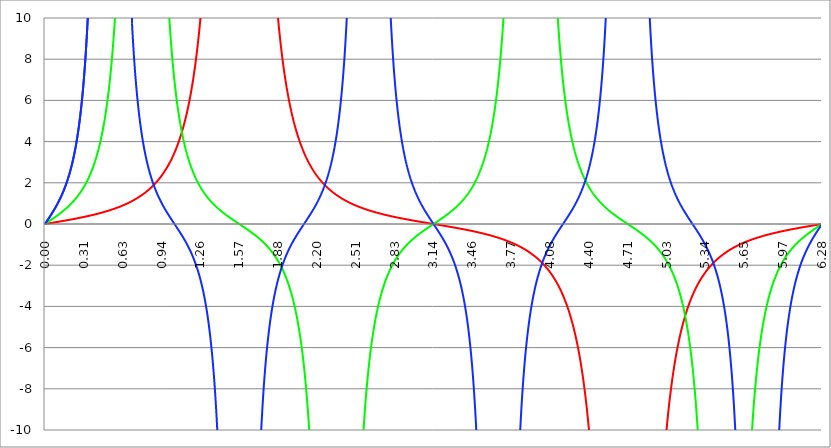
| Category | Series 1 | Series 0 | Series 2 |
|---|---|---|---|
| 0.0 | 0 | 0 | 0 |
| 0.00314159265358979 | 0.003 | 0.013 | 0.028 |
| 0.00628318530717958 | 0.006 | 0.025 | 0.057 |
| 0.00942477796076938 | 0.009 | 0.038 | 0.085 |
| 0.0125663706143592 | 0.013 | 0.05 | 0.113 |
| 0.015707963267949 | 0.016 | 0.063 | 0.142 |
| 0.0188495559215388 | 0.019 | 0.075 | 0.17 |
| 0.0219911485751285 | 0.022 | 0.088 | 0.199 |
| 0.0251327412287183 | 0.025 | 0.101 | 0.227 |
| 0.0282743338823081 | 0.028 | 0.113 | 0.256 |
| 0.0314159265358979 | 0.031 | 0.126 | 0.285 |
| 0.0345575191894877 | 0.035 | 0.139 | 0.314 |
| 0.0376991118430775 | 0.038 | 0.152 | 0.343 |
| 0.0408407044966673 | 0.041 | 0.164 | 0.372 |
| 0.0439822971502571 | 0.044 | 0.177 | 0.402 |
| 0.0471238898038469 | 0.047 | 0.19 | 0.431 |
| 0.0502654824574367 | 0.05 | 0.203 | 0.461 |
| 0.0534070751110265 | 0.054 | 0.216 | 0.491 |
| 0.0565486677646163 | 0.057 | 0.229 | 0.521 |
| 0.059690260418206 | 0.06 | 0.242 | 0.552 |
| 0.0628318530717958 | 0.063 | 0.255 | 0.583 |
| 0.0659734457253856 | 0.066 | 0.268 | 0.614 |
| 0.0691150383789754 | 0.069 | 0.281 | 0.645 |
| 0.0722566310325652 | 0.073 | 0.294 | 0.677 |
| 0.075398223686155 | 0.076 | 0.307 | 0.708 |
| 0.0785398163397448 | 0.079 | 0.321 | 0.741 |
| 0.0816814089933346 | 0.082 | 0.334 | 0.773 |
| 0.0848230016469244 | 0.085 | 0.348 | 0.806 |
| 0.0879645943005142 | 0.089 | 0.361 | 0.84 |
| 0.091106186954104 | 0.092 | 0.375 | 0.873 |
| 0.0942477796076937 | 0.095 | 0.388 | 0.908 |
| 0.0973893722612835 | 0.098 | 0.402 | 0.942 |
| 0.100530964914873 | 0.101 | 0.416 | 0.977 |
| 0.103672557568463 | 0.105 | 0.43 | 1.013 |
| 0.106814150222053 | 0.108 | 0.444 | 1.049 |
| 0.109955742875643 | 0.111 | 0.458 | 1.086 |
| 0.113097335529233 | 0.114 | 0.472 | 1.123 |
| 0.116238928182822 | 0.118 | 0.487 | 1.161 |
| 0.119380520836412 | 0.121 | 0.501 | 1.199 |
| 0.122522113490002 | 0.124 | 0.516 | 1.238 |
| 0.125663706143592 | 0.127 | 0.53 | 1.277 |
| 0.128805298797181 | 0.131 | 0.545 | 1.318 |
| 0.131946891450771 | 0.134 | 0.56 | 1.359 |
| 0.135088484104361 | 0.137 | 0.575 | 1.4 |
| 0.138230076757951 | 0.14 | 0.59 | 1.443 |
| 0.141371669411541 | 0.144 | 0.605 | 1.486 |
| 0.14451326206513 | 0.147 | 0.62 | 1.53 |
| 0.14765485471872 | 0.15 | 0.636 | 1.575 |
| 0.15079644737231 | 0.154 | 0.652 | 1.621 |
| 0.1539380400259 | 0.157 | 0.667 | 1.668 |
| 0.15707963267949 | 0.16 | 0.683 | 1.716 |
| 0.160221225333079 | 0.164 | 0.699 | 1.764 |
| 0.163362817986669 | 0.167 | 0.716 | 1.814 |
| 0.166504410640259 | 0.17 | 0.732 | 1.865 |
| 0.169646003293849 | 0.174 | 0.749 | 1.917 |
| 0.172787595947439 | 0.177 | 0.765 | 1.97 |
| 0.175929188601028 | 0.181 | 0.782 | 2.024 |
| 0.179070781254618 | 0.184 | 0.799 | 2.08 |
| 0.182212373908208 | 0.187 | 0.817 | 2.137 |
| 0.185353966561798 | 0.191 | 0.834 | 2.195 |
| 0.188495559215388 | 0.194 | 0.852 | 2.255 |
| 0.191637151868977 | 0.198 | 0.87 | 2.316 |
| 0.194778744522567 | 0.201 | 0.888 | 2.379 |
| 0.197920337176157 | 0.205 | 0.906 | 2.443 |
| 0.201061929829747 | 0.208 | 0.924 | 2.509 |
| 0.204203522483336 | 0.211 | 0.943 | 2.577 |
| 0.207345115136926 | 0.215 | 0.962 | 2.647 |
| 0.210486707790516 | 0.218 | 0.981 | 2.718 |
| 0.213628300444106 | 0.222 | 1.001 | 2.792 |
| 0.216769893097696 | 0.226 | 1.02 | 2.867 |
| 0.219911485751285 | 0.229 | 1.04 | 2.945 |
| 0.223053078404875 | 0.233 | 1.06 | 3.025 |
| 0.226194671058465 | 0.236 | 1.081 | 3.107 |
| 0.229336263712055 | 0.24 | 1.101 | 3.192 |
| 0.232477856365645 | 0.243 | 1.122 | 3.28 |
| 0.235619449019234 | 0.247 | 1.144 | 3.37 |
| 0.238761041672824 | 0.251 | 1.165 | 3.462 |
| 0.241902634326414 | 0.254 | 1.187 | 3.558 |
| 0.245044226980004 | 0.258 | 1.209 | 3.657 |
| 0.248185819633594 | 0.261 | 1.232 | 3.759 |
| 0.251327412287183 | 0.265 | 1.255 | 3.865 |
| 0.254469004940773 | 0.269 | 1.278 | 3.974 |
| 0.257610597594363 | 0.272 | 1.301 | 4.086 |
| 0.260752190247953 | 0.276 | 1.325 | 4.203 |
| 0.263893782901543 | 0.28 | 1.35 | 4.324 |
| 0.267035375555132 | 0.284 | 1.374 | 4.448 |
| 0.270176968208722 | 0.287 | 1.399 | 4.578 |
| 0.273318560862312 | 0.291 | 1.425 | 4.712 |
| 0.276460153515902 | 0.295 | 1.45 | 4.851 |
| 0.279601746169492 | 0.299 | 1.477 | 4.996 |
| 0.282743338823082 | 0.303 | 1.503 | 5.146 |
| 0.285884931476671 | 0.306 | 1.53 | 5.301 |
| 0.289026524130261 | 0.31 | 1.558 | 5.463 |
| 0.292168116783851 | 0.314 | 1.586 | 5.632 |
| 0.295309709437441 | 0.318 | 1.614 | 5.807 |
| 0.298451302091031 | 0.322 | 1.643 | 5.989 |
| 0.30159289474462 | 0.326 | 1.673 | 6.179 |
| 0.30473448739821 | 0.33 | 1.703 | 6.377 |
| 0.3078760800518 | 0.334 | 1.733 | 6.584 |
| 0.31101767270539 | 0.338 | 1.764 | 6.8 |
| 0.31415926535898 | 0.342 | 1.796 | 7.025 |
| 0.31730085801257 | 0.346 | 1.828 | 7.26 |
| 0.320442450666159 | 0.35 | 1.861 | 7.507 |
| 0.323584043319749 | 0.354 | 1.895 | 7.765 |
| 0.326725635973339 | 0.358 | 1.929 | 8.035 |
| 0.329867228626929 | 0.362 | 1.963 | 8.319 |
| 0.333008821280519 | 0.366 | 1.999 | 8.616 |
| 0.336150413934108 | 0.37 | 2.035 | 8.928 |
| 0.339292006587698 | 0.374 | 2.072 | 9.256 |
| 0.342433599241288 | 0.378 | 2.109 | 9.602 |
| 0.345575191894878 | 0.383 | 2.147 | 9.965 |
| 0.348716784548468 | 0.387 | 2.186 | 10.348 |
| 0.351858377202058 | 0.391 | 2.226 | 10.753 |
| 0.354999969855647 | 0.395 | 2.267 | 11.18 |
| 0.358141562509237 | 0.4 | 2.308 | 11.631 |
| 0.361283155162827 | 0.404 | 2.351 | 12.109 |
| 0.364424747816417 | 0.408 | 2.394 | 12.615 |
| 0.367566340470007 | 0.413 | 2.438 | 13.152 |
| 0.370707933123597 | 0.417 | 2.483 | 13.722 |
| 0.373849525777186 | 0.421 | 2.529 | 14.328 |
| 0.376991118430776 | 0.426 | 2.576 | 14.973 |
| 0.380132711084366 | 0.43 | 2.625 | 15.661 |
| 0.383274303737956 | 0.435 | 2.674 | 16.396 |
| 0.386415896391546 | 0.439 | 2.724 | 17.182 |
| 0.389557489045135 | 0.444 | 2.776 | 18.023 |
| 0.392699081698725 | 0.448 | 2.828 | 18.926 |
| 0.395840674352315 | 0.453 | 2.882 | 19.896 |
| 0.398982267005905 | 0.458 | 2.938 | 20.94 |
| 0.402123859659495 | 0.462 | 2.994 | 22.066 |
| 0.405265452313085 | 0.467 | 3.052 | 23.282 |
| 0.408407044966674 | 0.472 | 3.111 | 24.6 |
| 0.411548637620264 | 0.476 | 3.172 | 26.029 |
| 0.414690230273854 | 0.481 | 3.234 | 27.584 |
| 0.417831822927444 | 0.486 | 3.298 | 29.279 |
| 0.420973415581034 | 0.491 | 3.363 | 31.133 |
| 0.424115008234623 | 0.495 | 3.43 | 33.164 |
| 0.427256600888213 | 0.5 | 3.499 | 35.398 |
| 0.430398193541803 | 0.505 | 3.57 | 37.861 |
| 0.433539786195393 | 0.51 | 3.642 | 40.585 |
| 0.436681378848983 | 0.515 | 3.716 | 43.611 |
| 0.439822971502573 | 0.52 | 3.793 | 46.983 |
| 0.442964564156162 | 0.525 | 3.871 | 50.757 |
| 0.446106156809752 | 0.53 | 3.952 | 54.999 |
| 0.449247749463342 | 0.535 | 4.034 | 59.789 |
| 0.452389342116932 | 0.54 | 4.119 | 65.228 |
| 0.455530934770522 | 0.546 | 4.207 | 71.437 |
| 0.458672527424111 | 0.551 | 4.297 | 78.568 |
| 0.461814120077701 | 0.556 | 4.389 | 86.815 |
| 0.464955712731291 | 0.561 | 4.484 | 96.422 |
| 0.468097305384881 | 0.567 | 4.582 | 107.706 |
| 0.471238898038471 | 0.572 | 4.683 | 121.081 |
| 0.474380490692061 | 0.577 | 4.787 | 137.099 |
| 0.47752208334565 | 0.583 | 4.894 | 156.503 |
| 0.48066367599924 | 0.588 | 5.005 | 180.32 |
| 0.48380526865283 | 0.594 | 5.118 | 209.999 |
| 0.48694686130642 | 0.599 | 5.236 | 247.631 |
| 0.49008845396001 | 0.605 | 5.357 | 296.338 |
| 0.493230046613599 | 0.61 | 5.482 | 360.93 |
| 0.496371639267189 | 0.616 | 5.611 | 449.149 |
| 0.499513231920779 | 0.622 | 5.744 | 574.099 |
| 0.502654824574369 | 0.627 | 5.882 | 759.408 |
| 0.505796417227959 | 0.633 | 6.024 | 1051.276 |
| 0.508938009881549 | 0.639 | 6.171 | 1550.334 |
| 0.512079602535138 | 0.645 | 6.323 | 2511.595 |
| 0.515221195188728 | 0.651 | 6.481 | 4748.93 |
| 0.518362787842318 | 0.657 | 6.643 | 12158.042 |
| 0.521504380495908 | 0.663 | 6.812 | 75990.388 |
| 0.524645973149498 | 0.669 | 6.987 | 303963.051 |
| 0.527787565803087 | 0.675 | 7.168 | 18997.222 |
| 0.530929158456677 | 0.681 | 7.356 | 6202.838 |
| 0.534070751110267 | 0.687 | 7.552 | 3039.135 |
| 0.537212343763857 | 0.693 | 7.754 | 1798.101 |
| 0.540353936417447 | 0.7 | 7.964 | 1186.857 |
| 0.543495529071037 | 0.706 | 8.183 | 841.504 |
| 0.546637121724626 | 0.712 | 8.41 | 627.523 |
| 0.549778714378216 | 0.719 | 8.646 | 485.841 |
| 0.552920307031806 | 0.725 | 8.892 | 387.207 |
| 0.556061899685396 | 0.732 | 9.148 | 315.798 |
| 0.559203492338986 | 0.738 | 9.414 | 262.442 |
| 0.562345084992576 | 0.745 | 9.692 | 221.531 |
| 0.565486677646165 | 0.752 | 9.982 | 189.474 |
| 0.568628270299755 | 0.758 | 10.285 | 163.89 |
| 0.571769862953345 | 0.765 | 10.601 | 143.146 |
| 0.574911455606935 | 0.772 | 10.931 | 126.095 |
| 0.578053048260525 | 0.779 | 11.276 | 111.908 |
| 0.581194640914114 | 0.786 | 11.637 | 99.979 |
| 0.584336233567704 | 0.793 | 12.016 | 89.852 |
| 0.587477826221294 | 0.8 | 12.412 | 81.182 |
| 0.590619418874884 | 0.807 | 12.828 | 73.703 |
| 0.593761011528474 | 0.814 | 13.264 | 67.205 |
| 0.596902604182064 | 0.822 | 13.722 | 61.525 |
| 0.600044196835653 | 0.829 | 14.204 | 56.53 |
| 0.603185789489243 | 0.836 | 14.71 | 52.115 |
| 0.606327382142833 | 0.844 | 15.244 | 48.193 |
| 0.609468974796423 | 0.851 | 15.806 | 44.694 |
| 0.612610567450013 | 0.859 | 16.4 | 41.558 |
| 0.615752160103602 | 0.867 | 17.026 | 38.738 |
| 0.618893752757192 | 0.874 | 17.689 | 36.192 |
| 0.622035345410782 | 0.882 | 18.389 | 33.885 |
| 0.625176938064372 | 0.89 | 19.132 | 31.789 |
| 0.628318530717962 | 0.898 | 19.919 | 29.879 |
| 0.631460123371551 | 0.906 | 20.755 | 28.133 |
| 0.634601716025141 | 0.914 | 21.644 | 26.533 |
| 0.637743308678731 | 0.922 | 22.59 | 25.063 |
| 0.640884901332321 | 0.931 | 23.598 | 23.71 |
| 0.644026493985911 | 0.939 | 24.675 | 22.461 |
| 0.647168086639501 | 0.947 | 25.825 | 21.306 |
| 0.65030967929309 | 0.956 | 27.057 | 20.235 |
| 0.65345127194668 | 0.964 | 28.378 | 19.241 |
| 0.65659286460027 | 0.973 | 29.796 | 18.317 |
| 0.65973445725386 | 0.982 | 31.322 | 17.456 |
| 0.66287604990745 | 0.99 | 32.967 | 16.652 |
| 0.666017642561039 | 0.999 | 34.743 | 15.901 |
| 0.669159235214629 | 1.008 | 36.666 | 15.198 |
| 0.672300827868219 | 1.017 | 38.751 | 14.538 |
| 0.675442420521809 | 1.027 | 41.017 | 13.92 |
| 0.678584013175399 | 1.036 | 43.485 | 13.338 |
| 0.681725605828989 | 1.045 | 46.182 | 12.79 |
| 0.684867198482578 | 1.055 | 49.135 | 12.274 |
| 0.688008791136168 | 1.064 | 52.379 | 11.787 |
| 0.691150383789758 | 1.074 | 55.952 | 11.327 |
| 0.694291976443348 | 1.083 | 59.901 | 10.892 |
| 0.697433569096938 | 1.093 | 64.281 | 10.481 |
| 0.700575161750528 | 1.103 | 69.157 | 10.091 |
| 0.703716754404117 | 1.113 | 74.605 | 9.721 |
| 0.706858347057707 | 1.123 | 80.721 | 9.37 |
| 0.709999939711297 | 1.133 | 87.616 | 9.036 |
| 0.713141532364887 | 1.144 | 95.431 | 8.718 |
| 0.716283125018477 | 1.154 | 104.335 | 8.416 |
| 0.719424717672066 | 1.165 | 114.541 | 8.128 |
| 0.722566310325656 | 1.175 | 126.316 | 7.854 |
| 0.725707902979246 | 1.186 | 139.999 | 7.592 |
| 0.728849495632836 | 1.197 | 156.025 | 7.341 |
| 0.731991088286426 | 1.208 | 174.961 | 7.102 |
| 0.735132680940016 | 1.219 | 197.558 | 6.874 |
| 0.738274273593605 | 1.23 | 224.824 | 6.655 |
| 0.741415866247195 | 1.242 | 258.138 | 6.445 |
| 0.744557458900785 | 1.253 | 299.433 | 6.244 |
| 0.747699051554375 | 1.265 | 351.476 | 6.052 |
| 0.750840644207965 | 1.276 | 418.349 | 5.867 |
| 0.753982236861554 | 1.288 | 506.272 | 5.689 |
| 0.757123829515144 | 1.3 | 625.106 | 5.519 |
| 0.760265422168734 | 1.312 | 791.238 | 5.355 |
| 0.763407014822324 | 1.325 | 1033.556 | 5.197 |
| 0.766548607475914 | 1.337 | 1406.905 | 5.045 |
| 0.769690200129504 | 1.349 | 2026.09 | 4.899 |
| 0.772831792783093 | 1.362 | 3165.954 | 4.758 |
| 0.775973385436683 | 1.375 | 5628.621 | 4.622 |
| 0.779114978090273 | 1.388 | 12664.815 | 4.491 |
| 0.782256570743863 | 1.401 | 50660.258 | 4.365 |
| 0.785398163397453 | 1.414 | 25706381619688702014243471360 | 4.243 |
| 0.788539756051042 | 1.428 | 50660.258 | 4.125 |
| 0.791681348704632 | 1.441 | 12664.815 | 4.011 |
| 0.794822941358222 | 1.455 | 5628.621 | 3.901 |
| 0.797964534011812 | 1.469 | 3165.954 | 3.794 |
| 0.801106126665402 | 1.483 | 2026.09 | 3.691 |
| 0.804247719318992 | 1.497 | 1406.905 | 3.591 |
| 0.807389311972581 | 1.511 | 1033.556 | 3.494 |
| 0.810530904626171 | 1.526 | 791.238 | 3.4 |
| 0.813672497279761 | 1.541 | 625.106 | 3.309 |
| 0.816814089933351 | 1.556 | 506.272 | 3.221 |
| 0.819955682586941 | 1.571 | 418.349 | 3.135 |
| 0.823097275240531 | 1.586 | 351.476 | 3.052 |
| 0.82623886789412 | 1.601 | 299.433 | 2.971 |
| 0.82938046054771 | 1.617 | 258.138 | 2.893 |
| 0.8325220532013 | 1.633 | 224.824 | 2.817 |
| 0.83566364585489 | 1.649 | 197.558 | 2.743 |
| 0.83880523850848 | 1.665 | 174.961 | 2.67 |
| 0.841946831162069 | 1.682 | 156.025 | 2.6 |
| 0.845088423815659 | 1.698 | 139.999 | 2.532 |
| 0.848230016469249 | 1.715 | 126.316 | 2.465 |
| 0.851371609122839 | 1.732 | 114.541 | 2.4 |
| 0.854513201776429 | 1.75 | 104.335 | 2.337 |
| 0.857654794430019 | 1.767 | 95.431 | 2.275 |
| 0.860796387083608 | 1.785 | 87.616 | 2.215 |
| 0.863937979737198 | 1.803 | 80.721 | 2.156 |
| 0.867079572390788 | 1.821 | 74.605 | 2.099 |
| 0.870221165044378 | 1.84 | 69.157 | 2.043 |
| 0.873362757697968 | 1.858 | 64.281 | 1.988 |
| 0.876504350351557 | 1.877 | 59.901 | 1.934 |
| 0.879645943005147 | 1.896 | 55.952 | 1.882 |
| 0.882787535658737 | 1.916 | 52.379 | 1.831 |
| 0.885929128312327 | 1.936 | 49.135 | 1.781 |
| 0.889070720965917 | 1.956 | 46.182 | 1.732 |
| 0.892212313619507 | 1.976 | 43.485 | 1.684 |
| 0.895353906273096 | 1.996 | 41.017 | 1.637 |
| 0.898495498926686 | 2.017 | 38.751 | 1.59 |
| 0.901637091580276 | 2.038 | 36.666 | 1.545 |
| 0.904778684233866 | 2.06 | 34.743 | 1.501 |
| 0.907920276887456 | 2.081 | 32.967 | 1.457 |
| 0.911061869541045 | 2.103 | 31.322 | 1.415 |
| 0.914203462194635 | 2.126 | 29.796 | 1.373 |
| 0.917345054848225 | 2.148 | 28.378 | 1.331 |
| 0.920486647501815 | 2.171 | 27.057 | 1.291 |
| 0.923628240155405 | 2.195 | 25.825 | 1.251 |
| 0.926769832808995 | 2.218 | 24.675 | 1.212 |
| 0.929911425462584 | 2.242 | 23.598 | 1.173 |
| 0.933053018116174 | 2.267 | 22.59 | 1.135 |
| 0.936194610769764 | 2.291 | 21.644 | 1.098 |
| 0.939336203423354 | 2.316 | 20.755 | 1.061 |
| 0.942477796076944 | 2.342 | 19.919 | 1.025 |
| 0.945619388730533 | 2.367 | 19.132 | 0.989 |
| 0.948760981384123 | 2.394 | 18.389 | 0.954 |
| 0.951902574037713 | 2.42 | 17.689 | 0.919 |
| 0.955044166691303 | 2.447 | 17.026 | 0.885 |
| 0.958185759344893 | 2.475 | 16.4 | 0.851 |
| 0.961327351998483 | 2.502 | 15.806 | 0.817 |
| 0.964468944652072 | 2.531 | 15.244 | 0.784 |
| 0.967610537305662 | 2.559 | 14.71 | 0.752 |
| 0.970752129959252 | 2.588 | 14.204 | 0.719 |
| 0.973893722612842 | 2.618 | 13.722 | 0.687 |
| 0.977035315266432 | 2.648 | 13.264 | 0.655 |
| 0.980176907920022 | 2.678 | 12.828 | 0.624 |
| 0.983318500573611 | 2.709 | 12.412 | 0.593 |
| 0.986460093227201 | 2.741 | 12.016 | 0.562 |
| 0.989601685880791 | 2.773 | 11.637 | 0.531 |
| 0.992743278534381 | 2.805 | 11.276 | 0.501 |
| 0.995884871187971 | 2.838 | 10.931 | 0.471 |
| 0.99902646384156 | 2.872 | 10.601 | 0.441 |
| 1.00216805649515 | 2.906 | 10.285 | 0.411 |
| 1.00530964914874 | 2.941 | 9.982 | 0.382 |
| 1.00845124180233 | 2.976 | 9.692 | 0.353 |
| 1.01159283445592 | 3.012 | 9.414 | 0.324 |
| 1.01473442710951 | 3.048 | 9.148 | 0.294 |
| 1.017876019763099 | 3.085 | 8.892 | 0.266 |
| 1.021017612416689 | 3.123 | 8.646 | 0.237 |
| 1.02415920507028 | 3.162 | 8.41 | 0.208 |
| 1.027300797723869 | 3.201 | 8.183 | 0.18 |
| 1.030442390377459 | 3.24 | 7.964 | 0.151 |
| 1.033583983031048 | 3.281 | 7.754 | 0.123 |
| 1.036725575684638 | 3.322 | 7.552 | 0.094 |
| 1.039867168338228 | 3.364 | 7.356 | 0.066 |
| 1.043008760991818 | 3.406 | 7.168 | 0.038 |
| 1.046150353645408 | 3.449 | 6.987 | 0.009 |
| 1.049291946298998 | 3.494 | 6.812 | -0.019 |
| 1.052433538952587 | 3.539 | 6.643 | -0.047 |
| 1.055575131606177 | 3.584 | 6.481 | -0.075 |
| 1.058716724259767 | 3.631 | 6.323 | -0.104 |
| 1.061858316913357 | 3.678 | 6.171 | -0.132 |
| 1.064999909566947 | 3.727 | 6.024 | -0.161 |
| 1.068141502220536 | 3.776 | 5.882 | -0.189 |
| 1.071283094874126 | 3.826 | 5.744 | -0.218 |
| 1.074424687527716 | 3.877 | 5.611 | -0.246 |
| 1.077566280181306 | 3.929 | 5.482 | -0.275 |
| 1.080707872834896 | 3.982 | 5.357 | -0.304 |
| 1.083849465488486 | 4.036 | 5.236 | -0.333 |
| 1.086991058142075 | 4.091 | 5.118 | -0.362 |
| 1.090132650795665 | 4.148 | 5.005 | -0.392 |
| 1.093274243449255 | 4.205 | 4.894 | -0.421 |
| 1.096415836102845 | 4.263 | 4.787 | -0.451 |
| 1.099557428756435 | 4.323 | 4.683 | -0.481 |
| 1.102699021410025 | 4.384 | 4.582 | -0.511 |
| 1.105840614063614 | 4.446 | 4.484 | -0.542 |
| 1.108982206717204 | 4.509 | 4.389 | -0.572 |
| 1.112123799370794 | 4.574 | 4.297 | -0.603 |
| 1.115265392024384 | 4.64 | 4.207 | -0.634 |
| 1.118406984677974 | 4.707 | 4.119 | -0.666 |
| 1.121548577331563 | 4.776 | 4.034 | -0.698 |
| 1.124690169985153 | 4.846 | 3.952 | -0.73 |
| 1.127831762638743 | 4.918 | 3.871 | -0.762 |
| 1.130973355292333 | 4.991 | 3.793 | -0.795 |
| 1.134114947945923 | 5.066 | 3.716 | -0.828 |
| 1.137256540599513 | 5.142 | 3.642 | -0.862 |
| 1.140398133253102 | 5.22 | 3.57 | -0.896 |
| 1.143539725906692 | 5.3 | 3.499 | -0.931 |
| 1.146681318560282 | 5.382 | 3.43 | -0.966 |
| 1.149822911213872 | 5.465 | 3.363 | -1.001 |
| 1.152964503867462 | 5.551 | 3.298 | -1.037 |
| 1.156106096521051 | 5.638 | 3.234 | -1.073 |
| 1.159247689174641 | 5.727 | 3.172 | -1.11 |
| 1.162389281828231 | 5.819 | 3.111 | -1.148 |
| 1.165530874481821 | 5.912 | 3.052 | -1.186 |
| 1.168672467135411 | 6.008 | 2.994 | -1.225 |
| 1.171814059789001 | 6.106 | 2.938 | -1.264 |
| 1.17495565244259 | 6.206 | 2.882 | -1.304 |
| 1.17809724509618 | 6.309 | 2.828 | -1.345 |
| 1.18123883774977 | 6.414 | 2.776 | -1.386 |
| 1.18438043040336 | 6.522 | 2.724 | -1.429 |
| 1.18752202305695 | 6.632 | 2.674 | -1.472 |
| 1.190663615710539 | 6.745 | 2.625 | -1.516 |
| 1.193805208364129 | 6.861 | 2.576 | -1.56 |
| 1.19694680101772 | 6.98 | 2.529 | -1.606 |
| 1.200088393671309 | 7.102 | 2.483 | -1.652 |
| 1.203229986324899 | 7.227 | 2.438 | -1.7 |
| 1.206371578978489 | 7.355 | 2.394 | -1.748 |
| 1.209513171632078 | 7.487 | 2.351 | -1.797 |
| 1.212654764285668 | 7.622 | 2.308 | -1.848 |
| 1.215796356939258 | 7.761 | 2.267 | -1.899 |
| 1.218937949592848 | 7.903 | 2.226 | -1.952 |
| 1.222079542246438 | 8.05 | 2.186 | -2.006 |
| 1.225221134900027 | 8.2 | 2.147 | -2.061 |
| 1.228362727553617 | 8.354 | 2.109 | -2.118 |
| 1.231504320207207 | 8.513 | 2.072 | -2.176 |
| 1.234645912860797 | 8.676 | 2.035 | -2.235 |
| 1.237787505514387 | 8.844 | 1.999 | -2.296 |
| 1.240929098167977 | 9.017 | 1.963 | -2.358 |
| 1.244070690821566 | 9.195 | 1.929 | -2.422 |
| 1.247212283475156 | 9.378 | 1.895 | -2.487 |
| 1.250353876128746 | 9.566 | 1.861 | -2.554 |
| 1.253495468782336 | 9.76 | 1.828 | -2.623 |
| 1.256637061435926 | 9.96 | 1.796 | -2.694 |
| 1.259778654089515 | 10.165 | 1.764 | -2.767 |
| 1.262920246743105 | 10.378 | 1.733 | -2.842 |
| 1.266061839396695 | 10.596 | 1.703 | -2.919 |
| 1.269203432050285 | 10.822 | 1.673 | -2.998 |
| 1.272345024703875 | 11.055 | 1.643 | -3.08 |
| 1.275486617357465 | 11.295 | 1.614 | -3.164 |
| 1.278628210011054 | 11.543 | 1.586 | -3.25 |
| 1.281769802664644 | 11.799 | 1.558 | -3.339 |
| 1.284911395318234 | 12.064 | 1.53 | -3.431 |
| 1.288052987971824 | 12.337 | 1.503 | -3.526 |
| 1.291194580625414 | 12.62 | 1.477 | -3.624 |
| 1.294336173279003 | 12.913 | 1.45 | -3.725 |
| 1.297477765932593 | 13.215 | 1.425 | -3.829 |
| 1.300619358586183 | 13.528 | 1.399 | -3.937 |
| 1.303760951239773 | 13.853 | 1.374 | -4.048 |
| 1.306902543893363 | 14.189 | 1.35 | -4.164 |
| 1.310044136546953 | 14.537 | 1.325 | -4.283 |
| 1.313185729200542 | 14.898 | 1.301 | -4.406 |
| 1.316327321854132 | 15.272 | 1.278 | -4.534 |
| 1.319468914507722 | 15.661 | 1.255 | -4.667 |
| 1.322610507161312 | 16.064 | 1.232 | -4.804 |
| 1.325752099814902 | 16.484 | 1.209 | -4.947 |
| 1.328893692468491 | 16.919 | 1.187 | -5.095 |
| 1.332035285122081 | 17.372 | 1.165 | -5.249 |
| 1.335176877775671 | 17.843 | 1.144 | -5.409 |
| 1.338318470429261 | 18.333 | 1.122 | -5.575 |
| 1.341460063082851 | 18.843 | 1.101 | -5.747 |
| 1.344601655736441 | 19.375 | 1.081 | -5.927 |
| 1.34774324839003 | 19.93 | 1.06 | -6.115 |
| 1.35088484104362 | 20.508 | 1.04 | -6.31 |
| 1.35402643369721 | 21.112 | 1.02 | -6.514 |
| 1.3571680263508 | 21.743 | 1.001 | -6.727 |
| 1.36030961900439 | 22.402 | 0.981 | -6.949 |
| 1.363451211657979 | 23.091 | 0.962 | -7.181 |
| 1.36659280431157 | 23.812 | 0.943 | -7.424 |
| 1.369734396965159 | 24.568 | 0.924 | -7.678 |
| 1.372875989618749 | 25.359 | 0.906 | -7.944 |
| 1.376017582272339 | 26.189 | 0.888 | -8.223 |
| 1.379159174925929 | 27.061 | 0.87 | -8.515 |
| 1.382300767579518 | 27.976 | 0.852 | -8.822 |
| 1.385442360233108 | 28.938 | 0.834 | -9.145 |
| 1.388583952886698 | 29.951 | 0.817 | -9.485 |
| 1.391725545540288 | 31.017 | 0.799 | -9.842 |
| 1.394867138193878 | 32.141 | 0.782 | -10.218 |
| 1.398008730847468 | 33.326 | 0.765 | -10.616 |
| 1.401150323501057 | 34.578 | 0.749 | -11.035 |
| 1.404291916154647 | 35.902 | 0.732 | -11.478 |
| 1.407433508808237 | 37.303 | 0.716 | -11.946 |
| 1.410575101461827 | 38.787 | 0.699 | -12.443 |
| 1.413716694115417 | 40.36 | 0.683 | -12.969 |
| 1.416858286769006 | 42.032 | 0.667 | -13.528 |
| 1.419999879422596 | 43.808 | 0.652 | -14.122 |
| 1.423141472076186 | 45.7 | 0.636 | -14.754 |
| 1.426283064729776 | 47.715 | 0.62 | -15.427 |
| 1.429424657383366 | 49.867 | 0.605 | -16.146 |
| 1.432566250036956 | 52.168 | 0.59 | -16.914 |
| 1.435707842690545 | 54.63 | 0.575 | -17.736 |
| 1.438849435344135 | 57.271 | 0.56 | -18.618 |
| 1.441991027997725 | 60.107 | 0.545 | -19.565 |
| 1.445132620651315 | 63.158 | 0.53 | -20.583 |
| 1.448274213304905 | 66.447 | 0.516 | -21.681 |
| 1.451415805958494 | 70 | 0.501 | -22.866 |
| 1.454557398612084 | 73.844 | 0.487 | -24.149 |
| 1.457698991265674 | 78.013 | 0.472 | -25.539 |
| 1.460840583919264 | 82.544 | 0.458 | -27.051 |
| 1.463982176572854 | 87.481 | 0.444 | -28.698 |
| 1.467123769226444 | 92.873 | 0.43 | -30.496 |
| 1.470265361880033 | 98.779 | 0.416 | -32.466 |
| 1.473406954533623 | 105.266 | 0.402 | -34.629 |
| 1.476548547187213 | 112.412 | 0.388 | -37.012 |
| 1.479690139840803 | 120.31 | 0.375 | -39.646 |
| 1.482831732494393 | 129.069 | 0.361 | -42.566 |
| 1.485973325147982 | 138.819 | 0.348 | -45.817 |
| 1.489114917801572 | 149.716 | 0.334 | -49.451 |
| 1.492256510455162 | 161.947 | 0.321 | -53.528 |
| 1.495398103108752 | 175.738 | 0.307 | -58.126 |
| 1.498539695762342 | 191.366 | 0.294 | -63.336 |
| 1.501681288415932 | 209.174 | 0.281 | -69.273 |
| 1.504822881069521 | 229.586 | 0.268 | -76.078 |
| 1.507964473723111 | 253.136 | 0.255 | -83.928 |
| 1.511106066376701 | 280.501 | 0.242 | -93.05 |
| 1.514247659030291 | 312.553 | 0.229 | -103.735 |
| 1.517389251683881 | 350.425 | 0.216 | -116.36 |
| 1.520530844337471 | 395.619 | 0.203 | -131.425 |
| 1.52367243699106 | 450.15 | 0.19 | -149.602 |
| 1.52681402964465 | 516.778 | 0.177 | -171.812 |
| 1.52995562229824 | 599.367 | 0.164 | -199.342 |
| 1.53309721495183 | 703.453 | 0.152 | -234.038 |
| 1.53623880760542 | 837.198 | 0.139 | -278.62 |
| 1.539380400259009 | 1013.045 | 0.126 | -337.236 |
| 1.542521992912599 | 1250.712 | 0.113 | -416.458 |
| 1.545663585566189 | 1582.977 | 0.101 | -527.214 |
| 1.548805178219779 | 2067.613 | 0.088 | -688.759 |
| 1.551946770873369 | 2814.311 | 0.075 | -937.659 |
| 1.555088363526959 | 4052.681 | 0.063 | -1350.449 |
| 1.558229956180548 | 6332.407 | 0.05 | -2110.358 |
| 1.561371548834138 | 11257.743 | 0.038 | -3752.136 |
| 1.564513141487728 | 25330.129 | 0.025 | -8442.932 |
| 1.567654734141318 | 101321.017 | 0.013 | -33773.228 |
| 1.570796326794908 | 8203238119201189953198358528 | 0 | -2662539128422490196662026240 |
| 1.573937919448497 | 101321.017 | -0.013 | -33773.228 |
| 1.577079512102087 | 25330.129 | -0.025 | -8442.932 |
| 1.580221104755677 | 11257.743 | -0.038 | -3752.136 |
| 1.583362697409267 | 6332.407 | -0.05 | -2110.358 |
| 1.586504290062857 | 4052.681 | -0.063 | -1350.449 |
| 1.589645882716447 | 2814.311 | -0.075 | -937.659 |
| 1.592787475370036 | 2067.613 | -0.088 | -688.759 |
| 1.595929068023626 | 1582.977 | -0.101 | -527.214 |
| 1.599070660677216 | 1250.712 | -0.113 | -416.458 |
| 1.602212253330806 | 1013.045 | -0.126 | -337.236 |
| 1.605353845984396 | 837.198 | -0.139 | -278.62 |
| 1.608495438637985 | 703.453 | -0.152 | -234.038 |
| 1.611637031291575 | 599.367 | -0.164 | -199.342 |
| 1.614778623945165 | 516.778 | -0.177 | -171.812 |
| 1.617920216598755 | 450.15 | -0.19 | -149.602 |
| 1.621061809252345 | 395.619 | -0.203 | -131.425 |
| 1.624203401905935 | 350.425 | -0.216 | -116.36 |
| 1.627344994559524 | 312.553 | -0.229 | -103.735 |
| 1.630486587213114 | 280.501 | -0.242 | -93.05 |
| 1.633628179866704 | 253.136 | -0.255 | -83.928 |
| 1.636769772520294 | 229.586 | -0.268 | -76.078 |
| 1.639911365173884 | 209.174 | -0.281 | -69.273 |
| 1.643052957827473 | 191.366 | -0.294 | -63.336 |
| 1.646194550481063 | 175.738 | -0.307 | -58.126 |
| 1.649336143134653 | 161.947 | -0.321 | -53.528 |
| 1.652477735788243 | 149.716 | -0.334 | -49.451 |
| 1.655619328441833 | 138.819 | -0.348 | -45.817 |
| 1.658760921095423 | 129.069 | -0.361 | -42.566 |
| 1.661902513749012 | 120.31 | -0.375 | -39.646 |
| 1.665044106402602 | 112.412 | -0.388 | -37.012 |
| 1.668185699056192 | 105.266 | -0.402 | -34.629 |
| 1.671327291709782 | 98.779 | -0.416 | -32.466 |
| 1.674468884363372 | 92.873 | -0.43 | -30.496 |
| 1.677610477016961 | 87.481 | -0.444 | -28.698 |
| 1.680752069670551 | 82.544 | -0.458 | -27.051 |
| 1.683893662324141 | 78.013 | -0.472 | -25.539 |
| 1.687035254977731 | 73.844 | -0.487 | -24.149 |
| 1.690176847631321 | 70 | -0.501 | -22.866 |
| 1.693318440284911 | 66.447 | -0.516 | -21.681 |
| 1.6964600329385 | 63.158 | -0.53 | -20.583 |
| 1.69960162559209 | 60.107 | -0.545 | -19.565 |
| 1.70274321824568 | 57.271 | -0.56 | -18.618 |
| 1.70588481089927 | 54.63 | -0.575 | -17.736 |
| 1.70902640355286 | 52.168 | -0.59 | -16.914 |
| 1.712167996206449 | 49.867 | -0.605 | -16.146 |
| 1.715309588860039 | 47.715 | -0.62 | -15.427 |
| 1.71845118151363 | 45.7 | -0.636 | -14.754 |
| 1.721592774167219 | 43.808 | -0.652 | -14.122 |
| 1.724734366820809 | 42.032 | -0.667 | -13.528 |
| 1.727875959474399 | 40.36 | -0.683 | -12.969 |
| 1.731017552127988 | 38.787 | -0.699 | -12.443 |
| 1.734159144781578 | 37.303 | -0.716 | -11.946 |
| 1.737300737435168 | 35.902 | -0.732 | -11.478 |
| 1.740442330088758 | 34.578 | -0.749 | -11.035 |
| 1.743583922742348 | 33.326 | -0.765 | -10.616 |
| 1.746725515395937 | 32.141 | -0.782 | -10.218 |
| 1.749867108049527 | 31.017 | -0.799 | -9.842 |
| 1.753008700703117 | 29.951 | -0.817 | -9.485 |
| 1.756150293356707 | 28.938 | -0.834 | -9.145 |
| 1.759291886010297 | 27.976 | -0.852 | -8.822 |
| 1.762433478663887 | 27.061 | -0.87 | -8.515 |
| 1.765575071317476 | 26.189 | -0.888 | -8.223 |
| 1.768716663971066 | 25.359 | -0.906 | -7.944 |
| 1.771858256624656 | 24.568 | -0.924 | -7.678 |
| 1.774999849278246 | 23.812 | -0.943 | -7.424 |
| 1.778141441931836 | 23.091 | -0.962 | -7.181 |
| 1.781283034585426 | 22.402 | -0.981 | -6.949 |
| 1.784424627239015 | 21.743 | -1.001 | -6.727 |
| 1.787566219892605 | 21.112 | -1.02 | -6.514 |
| 1.790707812546195 | 20.508 | -1.04 | -6.31 |
| 1.793849405199785 | 19.93 | -1.06 | -6.115 |
| 1.796990997853375 | 19.375 | -1.081 | -5.927 |
| 1.800132590506964 | 18.843 | -1.101 | -5.747 |
| 1.803274183160554 | 18.333 | -1.122 | -5.575 |
| 1.806415775814144 | 17.843 | -1.144 | -5.409 |
| 1.809557368467734 | 17.372 | -1.165 | -5.249 |
| 1.812698961121324 | 16.919 | -1.187 | -5.095 |
| 1.815840553774914 | 16.484 | -1.209 | -4.947 |
| 1.818982146428503 | 16.064 | -1.232 | -4.804 |
| 1.822123739082093 | 15.661 | -1.255 | -4.667 |
| 1.825265331735683 | 15.272 | -1.278 | -4.534 |
| 1.828406924389273 | 14.898 | -1.301 | -4.406 |
| 1.831548517042863 | 14.537 | -1.325 | -4.283 |
| 1.834690109696452 | 14.189 | -1.35 | -4.164 |
| 1.837831702350042 | 13.853 | -1.374 | -4.048 |
| 1.840973295003632 | 13.528 | -1.399 | -3.937 |
| 1.844114887657222 | 13.215 | -1.425 | -3.829 |
| 1.847256480310812 | 12.913 | -1.45 | -3.725 |
| 1.850398072964402 | 12.62 | -1.477 | -3.624 |
| 1.853539665617991 | 12.337 | -1.503 | -3.526 |
| 1.856681258271581 | 12.064 | -1.53 | -3.431 |
| 1.859822850925171 | 11.799 | -1.558 | -3.339 |
| 1.862964443578761 | 11.543 | -1.586 | -3.25 |
| 1.866106036232351 | 11.295 | -1.614 | -3.164 |
| 1.86924762888594 | 11.055 | -1.643 | -3.08 |
| 1.87238922153953 | 10.822 | -1.673 | -2.998 |
| 1.87553081419312 | 10.596 | -1.703 | -2.919 |
| 1.87867240684671 | 10.378 | -1.733 | -2.842 |
| 1.8818139995003 | 10.165 | -1.764 | -2.767 |
| 1.88495559215389 | 9.96 | -1.796 | -2.694 |
| 1.888097184807479 | 9.76 | -1.828 | -2.623 |
| 1.891238777461069 | 9.566 | -1.861 | -2.554 |
| 1.89438037011466 | 9.378 | -1.895 | -2.487 |
| 1.897521962768249 | 9.195 | -1.929 | -2.422 |
| 1.900663555421839 | 9.017 | -1.963 | -2.358 |
| 1.903805148075429 | 8.844 | -1.999 | -2.296 |
| 1.906946740729018 | 8.676 | -2.035 | -2.235 |
| 1.910088333382608 | 8.513 | -2.072 | -2.176 |
| 1.913229926036198 | 8.354 | -2.109 | -2.118 |
| 1.916371518689788 | 8.2 | -2.147 | -2.061 |
| 1.919513111343378 | 8.05 | -2.186 | -2.006 |
| 1.922654703996967 | 7.903 | -2.226 | -1.952 |
| 1.925796296650557 | 7.761 | -2.267 | -1.899 |
| 1.928937889304147 | 7.622 | -2.308 | -1.848 |
| 1.932079481957737 | 7.487 | -2.351 | -1.797 |
| 1.935221074611327 | 7.355 | -2.394 | -1.748 |
| 1.938362667264917 | 7.227 | -2.438 | -1.7 |
| 1.941504259918506 | 7.102 | -2.483 | -1.652 |
| 1.944645852572096 | 6.98 | -2.529 | -1.606 |
| 1.947787445225686 | 6.861 | -2.576 | -1.56 |
| 1.950929037879276 | 6.745 | -2.625 | -1.516 |
| 1.954070630532866 | 6.632 | -2.674 | -1.472 |
| 1.957212223186455 | 6.522 | -2.724 | -1.429 |
| 1.960353815840045 | 6.414 | -2.776 | -1.386 |
| 1.963495408493635 | 6.309 | -2.828 | -1.345 |
| 1.966637001147225 | 6.206 | -2.882 | -1.304 |
| 1.969778593800815 | 6.106 | -2.938 | -1.264 |
| 1.972920186454405 | 6.008 | -2.994 | -1.225 |
| 1.976061779107994 | 5.912 | -3.052 | -1.186 |
| 1.979203371761584 | 5.819 | -3.111 | -1.148 |
| 1.982344964415174 | 5.727 | -3.172 | -1.11 |
| 1.985486557068764 | 5.638 | -3.234 | -1.073 |
| 1.988628149722354 | 5.551 | -3.298 | -1.037 |
| 1.991769742375943 | 5.465 | -3.363 | -1.001 |
| 1.994911335029533 | 5.382 | -3.43 | -0.966 |
| 1.998052927683123 | 5.3 | -3.499 | -0.931 |
| 2.001194520336712 | 5.22 | -3.57 | -0.896 |
| 2.004336112990302 | 5.142 | -3.642 | -0.862 |
| 2.007477705643892 | 5.066 | -3.716 | -0.828 |
| 2.010619298297482 | 4.991 | -3.793 | -0.795 |
| 2.013760890951071 | 4.918 | -3.871 | -0.762 |
| 2.016902483604661 | 4.846 | -3.952 | -0.73 |
| 2.02004407625825 | 4.776 | -4.034 | -0.698 |
| 2.02318566891184 | 4.707 | -4.119 | -0.666 |
| 2.02632726156543 | 4.64 | -4.207 | -0.634 |
| 2.029468854219019 | 4.574 | -4.297 | -0.603 |
| 2.032610446872609 | 4.509 | -4.389 | -0.572 |
| 2.035752039526198 | 4.446 | -4.484 | -0.542 |
| 2.038893632179788 | 4.384 | -4.582 | -0.511 |
| 2.042035224833378 | 4.323 | -4.683 | -0.481 |
| 2.045176817486967 | 4.263 | -4.787 | -0.451 |
| 2.048318410140557 | 4.205 | -4.894 | -0.421 |
| 2.051460002794146 | 4.148 | -5.005 | -0.392 |
| 2.054601595447736 | 4.091 | -5.118 | -0.362 |
| 2.057743188101325 | 4.036 | -5.236 | -0.333 |
| 2.060884780754915 | 3.982 | -5.357 | -0.304 |
| 2.064026373408505 | 3.929 | -5.482 | -0.275 |
| 2.067167966062094 | 3.877 | -5.611 | -0.246 |
| 2.070309558715684 | 3.826 | -5.744 | -0.218 |
| 2.073451151369273 | 3.776 | -5.882 | -0.189 |
| 2.076592744022863 | 3.727 | -6.024 | -0.161 |
| 2.079734336676452 | 3.678 | -6.171 | -0.132 |
| 2.082875929330042 | 3.631 | -6.323 | -0.104 |
| 2.086017521983632 | 3.584 | -6.481 | -0.075 |
| 2.089159114637221 | 3.539 | -6.643 | -0.047 |
| 2.092300707290811 | 3.494 | -6.812 | -0.019 |
| 2.095442299944401 | 3.449 | -6.987 | 0.009 |
| 2.09858389259799 | 3.406 | -7.168 | 0.038 |
| 2.10172548525158 | 3.364 | -7.356 | 0.066 |
| 2.104867077905169 | 3.322 | -7.552 | 0.094 |
| 2.108008670558759 | 3.281 | -7.754 | 0.123 |
| 2.111150263212349 | 3.24 | -7.964 | 0.151 |
| 2.114291855865938 | 3.201 | -8.183 | 0.18 |
| 2.117433448519528 | 3.162 | -8.41 | 0.208 |
| 2.120575041173117 | 3.123 | -8.646 | 0.237 |
| 2.123716633826707 | 3.085 | -8.892 | 0.266 |
| 2.126858226480297 | 3.048 | -9.148 | 0.294 |
| 2.129999819133886 | 3.012 | -9.414 | 0.324 |
| 2.133141411787476 | 2.976 | -9.692 | 0.353 |
| 2.136283004441065 | 2.941 | -9.982 | 0.382 |
| 2.139424597094655 | 2.906 | -10.285 | 0.411 |
| 2.142566189748245 | 2.872 | -10.601 | 0.441 |
| 2.145707782401834 | 2.838 | -10.931 | 0.471 |
| 2.148849375055424 | 2.805 | -11.276 | 0.501 |
| 2.151990967709013 | 2.773 | -11.637 | 0.531 |
| 2.155132560362603 | 2.741 | -12.016 | 0.562 |
| 2.158274153016193 | 2.709 | -12.412 | 0.593 |
| 2.161415745669782 | 2.678 | -12.828 | 0.624 |
| 2.164557338323372 | 2.648 | -13.264 | 0.655 |
| 2.167698930976961 | 2.618 | -13.722 | 0.687 |
| 2.170840523630551 | 2.588 | -14.204 | 0.719 |
| 2.173982116284141 | 2.559 | -14.71 | 0.752 |
| 2.17712370893773 | 2.531 | -15.244 | 0.784 |
| 2.18026530159132 | 2.502 | -15.806 | 0.817 |
| 2.183406894244909 | 2.475 | -16.4 | 0.851 |
| 2.186548486898499 | 2.447 | -17.026 | 0.885 |
| 2.189690079552089 | 2.42 | -17.689 | 0.919 |
| 2.192831672205678 | 2.394 | -18.389 | 0.954 |
| 2.195973264859268 | 2.367 | -19.132 | 0.989 |
| 2.199114857512857 | 2.342 | -19.919 | 1.025 |
| 2.202256450166447 | 2.316 | -20.755 | 1.061 |
| 2.205398042820036 | 2.291 | -21.644 | 1.098 |
| 2.208539635473626 | 2.267 | -22.59 | 1.135 |
| 2.211681228127216 | 2.242 | -23.598 | 1.173 |
| 2.214822820780805 | 2.218 | -24.675 | 1.212 |
| 2.217964413434395 | 2.195 | -25.825 | 1.251 |
| 2.221106006087984 | 2.171 | -27.057 | 1.291 |
| 2.224247598741574 | 2.148 | -28.378 | 1.331 |
| 2.227389191395164 | 2.126 | -29.796 | 1.373 |
| 2.230530784048753 | 2.103 | -31.322 | 1.415 |
| 2.233672376702343 | 2.081 | -32.967 | 1.457 |
| 2.236813969355933 | 2.06 | -34.743 | 1.501 |
| 2.239955562009522 | 2.038 | -36.666 | 1.545 |
| 2.243097154663112 | 2.017 | -38.751 | 1.59 |
| 2.246238747316701 | 1.996 | -41.017 | 1.637 |
| 2.249380339970291 | 1.976 | -43.485 | 1.684 |
| 2.252521932623881 | 1.956 | -46.182 | 1.732 |
| 2.25566352527747 | 1.936 | -49.135 | 1.781 |
| 2.25880511793106 | 1.916 | -52.379 | 1.831 |
| 2.261946710584649 | 1.896 | -55.952 | 1.882 |
| 2.265088303238239 | 1.877 | -59.901 | 1.934 |
| 2.268229895891829 | 1.858 | -64.281 | 1.988 |
| 2.271371488545418 | 1.84 | -69.157 | 2.043 |
| 2.274513081199008 | 1.821 | -74.605 | 2.099 |
| 2.277654673852597 | 1.803 | -80.721 | 2.156 |
| 2.280796266506186 | 1.785 | -87.616 | 2.215 |
| 2.283937859159776 | 1.767 | -95.431 | 2.275 |
| 2.287079451813366 | 1.75 | -104.335 | 2.337 |
| 2.290221044466955 | 1.732 | -114.541 | 2.4 |
| 2.293362637120545 | 1.715 | -126.316 | 2.465 |
| 2.296504229774135 | 1.698 | -139.999 | 2.532 |
| 2.299645822427724 | 1.682 | -156.025 | 2.6 |
| 2.302787415081314 | 1.665 | -174.961 | 2.67 |
| 2.305929007734904 | 1.649 | -197.558 | 2.743 |
| 2.309070600388493 | 1.633 | -224.824 | 2.817 |
| 2.312212193042083 | 1.617 | -258.138 | 2.893 |
| 2.315353785695672 | 1.601 | -299.433 | 2.971 |
| 2.318495378349262 | 1.586 | -351.476 | 3.052 |
| 2.321636971002852 | 1.571 | -418.349 | 3.135 |
| 2.324778563656441 | 1.556 | -506.272 | 3.221 |
| 2.327920156310031 | 1.541 | -625.106 | 3.309 |
| 2.33106174896362 | 1.526 | -791.238 | 3.4 |
| 2.33420334161721 | 1.511 | -1033.556 | 3.494 |
| 2.3373449342708 | 1.497 | -1406.905 | 3.591 |
| 2.340486526924389 | 1.483 | -2026.09 | 3.691 |
| 2.343628119577979 | 1.469 | -3165.954 | 3.794 |
| 2.346769712231568 | 1.455 | -5628.621 | 3.901 |
| 2.349911304885158 | 1.441 | -12664.815 | 4.011 |
| 2.353052897538748 | 1.428 | -50660.258 | 4.125 |
| 2.356194490192337 | 1.414 | -8562958301394150430309613568 | 4.243 |
| 2.359336082845927 | 1.401 | -50660.258 | 4.365 |
| 2.362477675499516 | 1.388 | -12664.815 | 4.491 |
| 2.365619268153106 | 1.375 | -5628.621 | 4.622 |
| 2.368760860806696 | 1.362 | -3165.954 | 4.758 |
| 2.371902453460285 | 1.349 | -2026.09 | 4.899 |
| 2.375044046113875 | 1.337 | -1406.905 | 5.045 |
| 2.378185638767464 | 1.325 | -1033.556 | 5.197 |
| 2.381327231421054 | 1.312 | -791.238 | 5.355 |
| 2.384468824074644 | 1.3 | -625.106 | 5.519 |
| 2.387610416728233 | 1.288 | -506.272 | 5.689 |
| 2.390752009381823 | 1.276 | -418.349 | 5.867 |
| 2.393893602035412 | 1.265 | -351.476 | 6.052 |
| 2.397035194689002 | 1.253 | -299.433 | 6.244 |
| 2.400176787342591 | 1.242 | -258.138 | 6.445 |
| 2.403318379996181 | 1.23 | -224.824 | 6.655 |
| 2.406459972649771 | 1.219 | -197.558 | 6.874 |
| 2.40960156530336 | 1.208 | -174.961 | 7.102 |
| 2.41274315795695 | 1.197 | -156.025 | 7.341 |
| 2.41588475061054 | 1.186 | -139.999 | 7.592 |
| 2.419026343264129 | 1.175 | -126.316 | 7.854 |
| 2.422167935917719 | 1.165 | -114.541 | 8.128 |
| 2.425309528571308 | 1.154 | -104.335 | 8.416 |
| 2.428451121224898 | 1.144 | -95.431 | 8.718 |
| 2.431592713878488 | 1.133 | -87.616 | 9.036 |
| 2.434734306532077 | 1.123 | -80.721 | 9.37 |
| 2.437875899185667 | 1.113 | -74.605 | 9.721 |
| 2.441017491839256 | 1.103 | -69.157 | 10.091 |
| 2.444159084492846 | 1.093 | -64.281 | 10.481 |
| 2.447300677146435 | 1.083 | -59.901 | 10.892 |
| 2.450442269800025 | 1.074 | -55.952 | 11.327 |
| 2.453583862453615 | 1.064 | -52.379 | 11.787 |
| 2.456725455107204 | 1.055 | -49.135 | 12.274 |
| 2.459867047760794 | 1.045 | -46.182 | 12.79 |
| 2.463008640414384 | 1.036 | -43.485 | 13.338 |
| 2.466150233067973 | 1.027 | -41.017 | 13.92 |
| 2.469291825721563 | 1.017 | -38.751 | 14.538 |
| 2.472433418375152 | 1.008 | -36.666 | 15.198 |
| 2.475575011028742 | 0.999 | -34.743 | 15.901 |
| 2.478716603682332 | 0.99 | -32.967 | 16.652 |
| 2.481858196335921 | 0.982 | -31.322 | 17.456 |
| 2.48499978898951 | 0.973 | -29.796 | 18.317 |
| 2.4881413816431 | 0.964 | -28.378 | 19.241 |
| 2.49128297429669 | 0.956 | -27.057 | 20.235 |
| 2.49442456695028 | 0.947 | -25.825 | 21.306 |
| 2.497566159603869 | 0.939 | -24.675 | 22.461 |
| 2.500707752257458 | 0.931 | -23.598 | 23.71 |
| 2.503849344911048 | 0.922 | -22.59 | 25.063 |
| 2.506990937564638 | 0.914 | -21.644 | 26.533 |
| 2.510132530218228 | 0.906 | -20.755 | 28.133 |
| 2.513274122871817 | 0.898 | -19.919 | 29.879 |
| 2.516415715525407 | 0.89 | -19.132 | 31.789 |
| 2.519557308178996 | 0.882 | -18.389 | 33.885 |
| 2.522698900832586 | 0.874 | -17.689 | 36.192 |
| 2.525840493486176 | 0.867 | -17.026 | 38.738 |
| 2.528982086139765 | 0.859 | -16.4 | 41.558 |
| 2.532123678793355 | 0.851 | -15.806 | 44.694 |
| 2.535265271446944 | 0.844 | -15.244 | 48.193 |
| 2.538406864100534 | 0.836 | -14.71 | 52.115 |
| 2.541548456754124 | 0.829 | -14.204 | 56.53 |
| 2.544690049407713 | 0.822 | -13.722 | 61.525 |
| 2.547831642061302 | 0.814 | -13.264 | 67.205 |
| 2.550973234714892 | 0.807 | -12.828 | 73.703 |
| 2.554114827368482 | 0.8 | -12.412 | 81.182 |
| 2.557256420022072 | 0.793 | -12.016 | 89.852 |
| 2.560398012675661 | 0.786 | -11.637 | 99.979 |
| 2.563539605329251 | 0.779 | -11.276 | 111.908 |
| 2.56668119798284 | 0.772 | -10.931 | 126.095 |
| 2.56982279063643 | 0.765 | -10.601 | 143.146 |
| 2.57296438329002 | 0.758 | -10.285 | 163.89 |
| 2.576105975943609 | 0.752 | -9.982 | 189.474 |
| 2.579247568597199 | 0.745 | -9.692 | 221.531 |
| 2.582389161250788 | 0.738 | -9.414 | 262.442 |
| 2.585530753904377 | 0.732 | -9.148 | 315.798 |
| 2.588672346557967 | 0.725 | -8.892 | 387.207 |
| 2.591813939211557 | 0.719 | -8.646 | 485.841 |
| 2.594955531865147 | 0.712 | -8.41 | 627.523 |
| 2.598097124518736 | 0.706 | -8.183 | 841.504 |
| 2.601238717172326 | 0.7 | -7.964 | 1186.857 |
| 2.604380309825915 | 0.693 | -7.754 | 1798.101 |
| 2.607521902479505 | 0.687 | -7.552 | 3039.135 |
| 2.610663495133095 | 0.681 | -7.356 | 6202.838 |
| 2.613805087786684 | 0.675 | -7.168 | 18997.222 |
| 2.616946680440274 | 0.669 | -6.987 | 303963.051 |
| 2.620088273093863 | 0.663 | -6.812 | 75990.388 |
| 2.623229865747452 | 0.657 | -6.643 | 12158.042 |
| 2.626371458401042 | 0.651 | -6.481 | 4748.93 |
| 2.629513051054632 | 0.645 | -6.323 | 2511.595 |
| 2.632654643708222 | 0.639 | -6.171 | 1550.334 |
| 2.635796236361811 | 0.633 | -6.024 | 1051.276 |
| 2.638937829015401 | 0.627 | -5.882 | 759.408 |
| 2.642079421668991 | 0.622 | -5.744 | 574.099 |
| 2.64522101432258 | 0.616 | -5.611 | 449.149 |
| 2.64836260697617 | 0.61 | -5.482 | 360.93 |
| 2.651504199629759 | 0.605 | -5.357 | 296.338 |
| 2.654645792283349 | 0.599 | -5.236 | 247.631 |
| 2.657787384936938 | 0.594 | -5.118 | 209.999 |
| 2.660928977590528 | 0.588 | -5.005 | 180.32 |
| 2.664070570244118 | 0.583 | -4.894 | 156.503 |
| 2.667212162897707 | 0.577 | -4.787 | 137.099 |
| 2.670353755551297 | 0.572 | -4.683 | 121.081 |
| 2.673495348204887 | 0.567 | -4.582 | 107.706 |
| 2.676636940858476 | 0.561 | -4.484 | 96.422 |
| 2.679778533512066 | 0.556 | -4.389 | 86.815 |
| 2.682920126165655 | 0.551 | -4.297 | 78.568 |
| 2.686061718819245 | 0.546 | -4.207 | 71.437 |
| 2.689203311472835 | 0.54 | -4.119 | 65.228 |
| 2.692344904126424 | 0.535 | -4.034 | 59.789 |
| 2.695486496780014 | 0.53 | -3.952 | 54.999 |
| 2.698628089433603 | 0.525 | -3.871 | 50.757 |
| 2.701769682087193 | 0.52 | -3.793 | 46.983 |
| 2.704911274740782 | 0.515 | -3.716 | 43.611 |
| 2.708052867394372 | 0.51 | -3.642 | 40.585 |
| 2.711194460047962 | 0.505 | -3.57 | 37.861 |
| 2.714336052701551 | 0.5 | -3.499 | 35.398 |
| 2.717477645355141 | 0.495 | -3.43 | 33.164 |
| 2.720619238008731 | 0.491 | -3.363 | 31.133 |
| 2.72376083066232 | 0.486 | -3.298 | 29.279 |
| 2.72690242331591 | 0.481 | -3.234 | 27.584 |
| 2.730044015969499 | 0.476 | -3.172 | 26.029 |
| 2.733185608623089 | 0.472 | -3.111 | 24.6 |
| 2.736327201276678 | 0.467 | -3.052 | 23.282 |
| 2.739468793930268 | 0.462 | -2.994 | 22.066 |
| 2.742610386583858 | 0.458 | -2.938 | 20.94 |
| 2.745751979237447 | 0.453 | -2.882 | 19.896 |
| 2.748893571891036 | 0.448 | -2.828 | 18.926 |
| 2.752035164544627 | 0.444 | -2.776 | 18.023 |
| 2.755176757198216 | 0.439 | -2.724 | 17.182 |
| 2.758318349851806 | 0.435 | -2.674 | 16.396 |
| 2.761459942505395 | 0.43 | -2.625 | 15.661 |
| 2.764601535158985 | 0.426 | -2.576 | 14.973 |
| 2.767743127812574 | 0.421 | -2.529 | 14.328 |
| 2.770884720466164 | 0.417 | -2.483 | 13.722 |
| 2.774026313119754 | 0.413 | -2.438 | 13.152 |
| 2.777167905773343 | 0.408 | -2.394 | 12.615 |
| 2.780309498426932 | 0.404 | -2.351 | 12.109 |
| 2.783451091080522 | 0.4 | -2.308 | 11.631 |
| 2.786592683734112 | 0.395 | -2.267 | 11.18 |
| 2.789734276387701 | 0.391 | -2.226 | 10.753 |
| 2.792875869041291 | 0.387 | -2.186 | 10.348 |
| 2.796017461694881 | 0.383 | -2.147 | 9.965 |
| 2.79915905434847 | 0.378 | -2.109 | 9.602 |
| 2.80230064700206 | 0.374 | -2.072 | 9.256 |
| 2.80544223965565 | 0.37 | -2.035 | 8.928 |
| 2.808583832309239 | 0.366 | -1.999 | 8.616 |
| 2.811725424962829 | 0.362 | -1.963 | 8.319 |
| 2.814867017616419 | 0.358 | -1.929 | 8.035 |
| 2.818008610270008 | 0.354 | -1.895 | 7.765 |
| 2.821150202923598 | 0.35 | -1.861 | 7.507 |
| 2.824291795577187 | 0.346 | -1.828 | 7.26 |
| 2.827433388230777 | 0.342 | -1.796 | 7.025 |
| 2.830574980884366 | 0.338 | -1.764 | 6.8 |
| 2.833716573537956 | 0.334 | -1.733 | 6.584 |
| 2.836858166191546 | 0.33 | -1.703 | 6.377 |
| 2.839999758845135 | 0.326 | -1.673 | 6.179 |
| 2.843141351498725 | 0.322 | -1.643 | 5.989 |
| 2.846282944152314 | 0.318 | -1.614 | 5.807 |
| 2.849424536805904 | 0.314 | -1.586 | 5.632 |
| 2.852566129459494 | 0.31 | -1.558 | 5.463 |
| 2.855707722113083 | 0.306 | -1.53 | 5.301 |
| 2.858849314766673 | 0.303 | -1.503 | 5.146 |
| 2.861990907420262 | 0.299 | -1.477 | 4.996 |
| 2.865132500073852 | 0.295 | -1.45 | 4.851 |
| 2.868274092727442 | 0.291 | -1.425 | 4.712 |
| 2.871415685381031 | 0.287 | -1.399 | 4.578 |
| 2.874557278034621 | 0.284 | -1.374 | 4.448 |
| 2.87769887068821 | 0.28 | -1.35 | 4.324 |
| 2.8808404633418 | 0.276 | -1.325 | 4.203 |
| 2.88398205599539 | 0.272 | -1.301 | 4.086 |
| 2.88712364864898 | 0.269 | -1.278 | 3.974 |
| 2.890265241302569 | 0.265 | -1.255 | 3.865 |
| 2.893406833956158 | 0.261 | -1.232 | 3.759 |
| 2.896548426609748 | 0.258 | -1.209 | 3.657 |
| 2.899690019263338 | 0.254 | -1.187 | 3.558 |
| 2.902831611916927 | 0.251 | -1.165 | 3.462 |
| 2.905973204570517 | 0.247 | -1.144 | 3.37 |
| 2.909114797224106 | 0.243 | -1.122 | 3.28 |
| 2.912256389877696 | 0.24 | -1.101 | 3.192 |
| 2.915397982531286 | 0.236 | -1.081 | 3.107 |
| 2.918539575184875 | 0.233 | -1.06 | 3.025 |
| 2.921681167838465 | 0.229 | -1.04 | 2.945 |
| 2.924822760492054 | 0.226 | -1.02 | 2.867 |
| 2.927964353145644 | 0.222 | -1.001 | 2.792 |
| 2.931105945799234 | 0.218 | -0.981 | 2.718 |
| 2.934247538452823 | 0.215 | -0.962 | 2.647 |
| 2.937389131106413 | 0.211 | -0.943 | 2.577 |
| 2.940530723760002 | 0.208 | -0.924 | 2.509 |
| 2.943672316413592 | 0.205 | -0.906 | 2.443 |
| 2.946813909067182 | 0.201 | -0.888 | 2.379 |
| 2.949955501720771 | 0.198 | -0.87 | 2.316 |
| 2.953097094374361 | 0.194 | -0.852 | 2.255 |
| 2.95623868702795 | 0.191 | -0.834 | 2.195 |
| 2.95938027968154 | 0.187 | -0.817 | 2.137 |
| 2.96252187233513 | 0.184 | -0.799 | 2.08 |
| 2.965663464988719 | 0.181 | -0.782 | 2.024 |
| 2.968805057642309 | 0.177 | -0.765 | 1.97 |
| 2.971946650295898 | 0.174 | -0.749 | 1.917 |
| 2.975088242949488 | 0.17 | -0.732 | 1.865 |
| 2.978229835603078 | 0.167 | -0.716 | 1.814 |
| 2.981371428256667 | 0.164 | -0.699 | 1.764 |
| 2.984513020910257 | 0.16 | -0.683 | 1.716 |
| 2.987654613563846 | 0.157 | -0.667 | 1.668 |
| 2.990796206217436 | 0.154 | -0.652 | 1.621 |
| 2.993937798871025 | 0.15 | -0.636 | 1.575 |
| 2.997079391524615 | 0.147 | -0.62 | 1.53 |
| 3.000220984178205 | 0.144 | -0.605 | 1.486 |
| 3.003362576831794 | 0.14 | -0.59 | 1.443 |
| 3.006504169485384 | 0.137 | -0.575 | 1.4 |
| 3.009645762138974 | 0.134 | -0.56 | 1.359 |
| 3.012787354792563 | 0.131 | -0.545 | 1.318 |
| 3.015928947446153 | 0.127 | -0.53 | 1.277 |
| 3.019070540099742 | 0.124 | -0.516 | 1.238 |
| 3.022212132753332 | 0.121 | -0.501 | 1.199 |
| 3.025353725406922 | 0.118 | -0.487 | 1.161 |
| 3.028495318060511 | 0.114 | -0.472 | 1.123 |
| 3.031636910714101 | 0.111 | -0.458 | 1.086 |
| 3.03477850336769 | 0.108 | -0.444 | 1.049 |
| 3.03792009602128 | 0.105 | -0.43 | 1.013 |
| 3.04106168867487 | 0.101 | -0.416 | 0.977 |
| 3.04420328132846 | 0.098 | -0.402 | 0.942 |
| 3.047344873982049 | 0.095 | -0.388 | 0.908 |
| 3.050486466635638 | 0.092 | -0.375 | 0.873 |
| 3.053628059289228 | 0.089 | -0.361 | 0.84 |
| 3.056769651942818 | 0.085 | -0.348 | 0.806 |
| 3.059911244596407 | 0.082 | -0.334 | 0.773 |
| 3.063052837249997 | 0.079 | -0.321 | 0.741 |
| 3.066194429903586 | 0.076 | -0.307 | 0.708 |
| 3.069336022557176 | 0.073 | -0.294 | 0.677 |
| 3.072477615210766 | 0.069 | -0.281 | 0.645 |
| 3.075619207864355 | 0.066 | -0.268 | 0.614 |
| 3.078760800517945 | 0.063 | -0.255 | 0.583 |
| 3.081902393171534 | 0.06 | -0.242 | 0.552 |
| 3.085043985825124 | 0.057 | -0.229 | 0.521 |
| 3.088185578478713 | 0.054 | -0.216 | 0.491 |
| 3.091327171132303 | 0.05 | -0.203 | 0.461 |
| 3.094468763785893 | 0.047 | -0.19 | 0.431 |
| 3.097610356439482 | 0.044 | -0.177 | 0.402 |
| 3.100751949093072 | 0.041 | -0.164 | 0.372 |
| 3.103893541746661 | 0.038 | -0.152 | 0.343 |
| 3.107035134400251 | 0.035 | -0.139 | 0.314 |
| 3.110176727053841 | 0.031 | -0.126 | 0.285 |
| 3.11331831970743 | 0.028 | -0.113 | 0.256 |
| 3.11645991236102 | 0.025 | -0.101 | 0.227 |
| 3.11960150501461 | 0.022 | -0.088 | 0.199 |
| 3.122743097668199 | 0.019 | -0.075 | 0.17 |
| 3.125884690321789 | 0.016 | -0.063 | 0.142 |
| 3.129026282975378 | 0.013 | -0.05 | 0.113 |
| 3.132167875628968 | 0.009 | -0.038 | 0.085 |
| 3.135309468282557 | 0.006 | -0.025 | 0.057 |
| 3.138451060936147 | 0.003 | -0.013 | 0.028 |
| 3.141592653589737 | 0 | 0 | 0 |
| 3.144734246243326 | -0.003 | 0.013 | -0.028 |
| 3.147875838896916 | -0.006 | 0.025 | -0.057 |
| 3.151017431550505 | -0.009 | 0.038 | -0.085 |
| 3.154159024204095 | -0.013 | 0.05 | -0.113 |
| 3.157300616857685 | -0.016 | 0.063 | -0.142 |
| 3.160442209511274 | -0.019 | 0.075 | -0.17 |
| 3.163583802164864 | -0.022 | 0.088 | -0.199 |
| 3.166725394818453 | -0.025 | 0.101 | -0.227 |
| 3.169866987472043 | -0.028 | 0.113 | -0.256 |
| 3.173008580125633 | -0.031 | 0.126 | -0.285 |
| 3.176150172779222 | -0.035 | 0.139 | -0.314 |
| 3.179291765432812 | -0.038 | 0.152 | -0.343 |
| 3.182433358086401 | -0.041 | 0.164 | -0.372 |
| 3.185574950739991 | -0.044 | 0.177 | -0.402 |
| 3.188716543393581 | -0.047 | 0.19 | -0.431 |
| 3.19185813604717 | -0.05 | 0.203 | -0.461 |
| 3.19499972870076 | -0.054 | 0.216 | -0.491 |
| 3.198141321354349 | -0.057 | 0.229 | -0.521 |
| 3.20128291400794 | -0.06 | 0.242 | -0.552 |
| 3.204424506661528 | -0.063 | 0.255 | -0.583 |
| 3.207566099315118 | -0.066 | 0.268 | -0.614 |
| 3.210707691968708 | -0.069 | 0.281 | -0.645 |
| 3.213849284622297 | -0.073 | 0.294 | -0.677 |
| 3.216990877275887 | -0.076 | 0.307 | -0.708 |
| 3.220132469929476 | -0.079 | 0.321 | -0.741 |
| 3.223274062583066 | -0.082 | 0.334 | -0.773 |
| 3.226415655236656 | -0.085 | 0.348 | -0.806 |
| 3.229557247890245 | -0.089 | 0.361 | -0.84 |
| 3.232698840543835 | -0.092 | 0.375 | -0.873 |
| 3.235840433197425 | -0.095 | 0.388 | -0.908 |
| 3.238982025851014 | -0.098 | 0.402 | -0.942 |
| 3.242123618504604 | -0.101 | 0.416 | -0.977 |
| 3.245265211158193 | -0.105 | 0.43 | -1.013 |
| 3.248406803811783 | -0.108 | 0.444 | -1.049 |
| 3.251548396465373 | -0.111 | 0.458 | -1.086 |
| 3.254689989118962 | -0.114 | 0.472 | -1.123 |
| 3.257831581772551 | -0.118 | 0.487 | -1.161 |
| 3.260973174426141 | -0.121 | 0.501 | -1.199 |
| 3.26411476707973 | -0.124 | 0.516 | -1.238 |
| 3.267256359733321 | -0.127 | 0.53 | -1.277 |
| 3.27039795238691 | -0.131 | 0.545 | -1.318 |
| 3.2735395450405 | -0.134 | 0.56 | -1.359 |
| 3.276681137694089 | -0.137 | 0.575 | -1.4 |
| 3.279822730347679 | -0.14 | 0.59 | -1.443 |
| 3.282964323001269 | -0.144 | 0.605 | -1.486 |
| 3.286105915654858 | -0.147 | 0.62 | -1.53 |
| 3.289247508308448 | -0.15 | 0.636 | -1.575 |
| 3.292389100962037 | -0.154 | 0.652 | -1.621 |
| 3.295530693615627 | -0.157 | 0.667 | -1.668 |
| 3.298672286269217 | -0.16 | 0.683 | -1.716 |
| 3.301813878922806 | -0.164 | 0.699 | -1.764 |
| 3.304955471576396 | -0.167 | 0.716 | -1.814 |
| 3.308097064229985 | -0.17 | 0.732 | -1.865 |
| 3.311238656883575 | -0.174 | 0.749 | -1.917 |
| 3.314380249537165 | -0.177 | 0.765 | -1.97 |
| 3.317521842190754 | -0.181 | 0.782 | -2.024 |
| 3.320663434844344 | -0.184 | 0.799 | -2.08 |
| 3.323805027497933 | -0.187 | 0.817 | -2.137 |
| 3.326946620151523 | -0.191 | 0.834 | -2.195 |
| 3.330088212805113 | -0.194 | 0.852 | -2.255 |
| 3.333229805458702 | -0.198 | 0.87 | -2.316 |
| 3.336371398112292 | -0.201 | 0.888 | -2.379 |
| 3.339512990765881 | -0.205 | 0.906 | -2.443 |
| 3.342654583419471 | -0.208 | 0.924 | -2.509 |
| 3.345796176073061 | -0.211 | 0.943 | -2.577 |
| 3.34893776872665 | -0.215 | 0.962 | -2.647 |
| 3.35207936138024 | -0.218 | 0.981 | -2.718 |
| 3.355220954033829 | -0.222 | 1.001 | -2.792 |
| 3.358362546687419 | -0.226 | 1.02 | -2.867 |
| 3.361504139341009 | -0.229 | 1.04 | -2.945 |
| 3.364645731994598 | -0.233 | 1.06 | -3.025 |
| 3.367787324648188 | -0.236 | 1.081 | -3.107 |
| 3.370928917301777 | -0.24 | 1.101 | -3.192 |
| 3.374070509955367 | -0.243 | 1.122 | -3.28 |
| 3.377212102608956 | -0.247 | 1.144 | -3.37 |
| 3.380353695262546 | -0.251 | 1.165 | -3.462 |
| 3.383495287916136 | -0.254 | 1.187 | -3.558 |
| 3.386636880569725 | -0.258 | 1.209 | -3.657 |
| 3.389778473223315 | -0.261 | 1.232 | -3.759 |
| 3.392920065876904 | -0.265 | 1.255 | -3.865 |
| 3.396061658530494 | -0.269 | 1.278 | -3.974 |
| 3.399203251184084 | -0.272 | 1.301 | -4.086 |
| 3.402344843837673 | -0.276 | 1.325 | -4.203 |
| 3.405486436491263 | -0.28 | 1.35 | -4.324 |
| 3.408628029144852 | -0.284 | 1.374 | -4.448 |
| 3.411769621798442 | -0.287 | 1.399 | -4.578 |
| 3.414911214452032 | -0.291 | 1.425 | -4.712 |
| 3.418052807105621 | -0.295 | 1.45 | -4.851 |
| 3.421194399759211 | -0.299 | 1.477 | -4.996 |
| 3.4243359924128 | -0.303 | 1.503 | -5.146 |
| 3.42747758506639 | -0.306 | 1.53 | -5.301 |
| 3.43061917771998 | -0.31 | 1.558 | -5.463 |
| 3.433760770373569 | -0.314 | 1.586 | -5.632 |
| 3.436902363027159 | -0.318 | 1.614 | -5.807 |
| 3.440043955680748 | -0.322 | 1.643 | -5.989 |
| 3.443185548334338 | -0.326 | 1.673 | -6.179 |
| 3.446327140987927 | -0.33 | 1.703 | -6.377 |
| 3.449468733641517 | -0.334 | 1.733 | -6.584 |
| 3.452610326295107 | -0.338 | 1.764 | -6.8 |
| 3.455751918948696 | -0.342 | 1.796 | -7.025 |
| 3.458893511602286 | -0.346 | 1.828 | -7.26 |
| 3.462035104255876 | -0.35 | 1.861 | -7.507 |
| 3.465176696909465 | -0.354 | 1.895 | -7.765 |
| 3.468318289563055 | -0.358 | 1.929 | -8.035 |
| 3.471459882216644 | -0.362 | 1.963 | -8.319 |
| 3.474601474870234 | -0.366 | 1.999 | -8.616 |
| 3.477743067523824 | -0.37 | 2.035 | -8.928 |
| 3.480884660177413 | -0.374 | 2.072 | -9.256 |
| 3.484026252831002 | -0.378 | 2.109 | -9.602 |
| 3.487167845484592 | -0.383 | 2.147 | -9.965 |
| 3.490309438138182 | -0.387 | 2.186 | -10.348 |
| 3.493451030791772 | -0.391 | 2.226 | -10.753 |
| 3.496592623445361 | -0.395 | 2.267 | -11.18 |
| 3.499734216098951 | -0.4 | 2.308 | -11.631 |
| 3.50287580875254 | -0.404 | 2.351 | -12.109 |
| 3.50601740140613 | -0.408 | 2.394 | -12.615 |
| 3.50915899405972 | -0.413 | 2.438 | -13.152 |
| 3.512300586713309 | -0.417 | 2.483 | -13.722 |
| 3.515442179366899 | -0.421 | 2.529 | -14.328 |
| 3.518583772020488 | -0.426 | 2.576 | -14.973 |
| 3.521725364674078 | -0.43 | 2.625 | -15.661 |
| 3.524866957327668 | -0.435 | 2.674 | -16.396 |
| 3.528008549981257 | -0.439 | 2.724 | -17.182 |
| 3.531150142634847 | -0.444 | 2.776 | -18.023 |
| 3.534291735288436 | -0.448 | 2.828 | -18.926 |
| 3.537433327942026 | -0.453 | 2.882 | -19.896 |
| 3.540574920595616 | -0.458 | 2.938 | -20.94 |
| 3.543716513249205 | -0.462 | 2.994 | -22.066 |
| 3.546858105902795 | -0.467 | 3.052 | -23.282 |
| 3.549999698556384 | -0.472 | 3.111 | -24.6 |
| 3.553141291209974 | -0.476 | 3.172 | -26.029 |
| 3.556282883863564 | -0.481 | 3.234 | -27.584 |
| 3.559424476517153 | -0.486 | 3.298 | -29.279 |
| 3.562566069170743 | -0.491 | 3.363 | -31.133 |
| 3.565707661824332 | -0.495 | 3.43 | -33.164 |
| 3.568849254477922 | -0.5 | 3.499 | -35.398 |
| 3.571990847131511 | -0.505 | 3.57 | -37.861 |
| 3.575132439785101 | -0.51 | 3.642 | -40.585 |
| 3.578274032438691 | -0.515 | 3.716 | -43.611 |
| 3.58141562509228 | -0.52 | 3.793 | -46.983 |
| 3.58455721774587 | -0.525 | 3.871 | -50.757 |
| 3.58769881039946 | -0.53 | 3.952 | -54.999 |
| 3.590840403053049 | -0.535 | 4.034 | -59.789 |
| 3.593981995706639 | -0.54 | 4.119 | -65.228 |
| 3.597123588360228 | -0.546 | 4.207 | -71.437 |
| 3.600265181013818 | -0.551 | 4.297 | -78.568 |
| 3.603406773667407 | -0.556 | 4.389 | -86.815 |
| 3.606548366320997 | -0.561 | 4.484 | -96.422 |
| 3.609689958974587 | -0.567 | 4.582 | -107.706 |
| 3.612831551628176 | -0.572 | 4.683 | -121.081 |
| 3.615973144281766 | -0.577 | 4.787 | -137.099 |
| 3.619114736935355 | -0.583 | 4.894 | -156.503 |
| 3.622256329588945 | -0.588 | 5.005 | -180.32 |
| 3.625397922242534 | -0.594 | 5.118 | -209.999 |
| 3.628539514896124 | -0.599 | 5.236 | -247.631 |
| 3.631681107549714 | -0.605 | 5.357 | -296.338 |
| 3.634822700203303 | -0.61 | 5.482 | -360.93 |
| 3.637964292856893 | -0.616 | 5.611 | -449.149 |
| 3.641105885510483 | -0.622 | 5.744 | -574.099 |
| 3.644247478164072 | -0.627 | 5.882 | -759.408 |
| 3.647389070817662 | -0.633 | 6.024 | -1051.276 |
| 3.650530663471251 | -0.639 | 6.171 | -1550.334 |
| 3.653672256124841 | -0.645 | 6.323 | -2511.595 |
| 3.656813848778431 | -0.651 | 6.481 | -4748.93 |
| 3.65995544143202 | -0.657 | 6.643 | -12158.042 |
| 3.66309703408561 | -0.663 | 6.812 | -75990.388 |
| 3.666238626739199 | -0.669 | 6.987 | -303963.051 |
| 3.66938021939279 | -0.675 | 7.168 | -18997.222 |
| 3.672521812046378 | -0.681 | 7.356 | -6202.838 |
| 3.675663404699968 | -0.687 | 7.552 | -3039.135 |
| 3.678804997353558 | -0.693 | 7.754 | -1798.101 |
| 3.681946590007147 | -0.7 | 7.964 | -1186.857 |
| 3.685088182660737 | -0.706 | 8.183 | -841.504 |
| 3.688229775314326 | -0.712 | 8.41 | -627.523 |
| 3.691371367967916 | -0.719 | 8.646 | -485.841 |
| 3.694512960621506 | -0.725 | 8.892 | -387.207 |
| 3.697654553275095 | -0.732 | 9.148 | -315.798 |
| 3.700796145928685 | -0.738 | 9.414 | -262.442 |
| 3.703937738582274 | -0.745 | 9.692 | -221.531 |
| 3.707079331235864 | -0.752 | 9.982 | -189.474 |
| 3.710220923889454 | -0.758 | 10.285 | -163.89 |
| 3.713362516543043 | -0.765 | 10.601 | -143.146 |
| 3.716504109196633 | -0.772 | 10.931 | -126.095 |
| 3.719645701850223 | -0.779 | 11.276 | -111.908 |
| 3.722787294503812 | -0.786 | 11.637 | -99.979 |
| 3.725928887157402 | -0.793 | 12.016 | -89.852 |
| 3.729070479810991 | -0.8 | 12.412 | -81.182 |
| 3.732212072464581 | -0.807 | 12.828 | -73.703 |
| 3.735353665118171 | -0.814 | 13.264 | -67.205 |
| 3.73849525777176 | -0.822 | 13.722 | -61.525 |
| 3.74163685042535 | -0.829 | 14.204 | -56.53 |
| 3.744778443078939 | -0.836 | 14.71 | -52.115 |
| 3.747920035732529 | -0.844 | 15.244 | -48.193 |
| 3.751061628386119 | -0.851 | 15.806 | -44.694 |
| 3.754203221039708 | -0.859 | 16.4 | -41.558 |
| 3.757344813693298 | -0.867 | 17.026 | -38.738 |
| 3.760486406346887 | -0.874 | 17.689 | -36.192 |
| 3.763627999000477 | -0.882 | 18.389 | -33.885 |
| 3.766769591654067 | -0.89 | 19.132 | -31.789 |
| 3.769911184307656 | -0.898 | 19.919 | -29.879 |
| 3.773052776961246 | -0.906 | 20.755 | -28.133 |
| 3.776194369614835 | -0.914 | 21.644 | -26.533 |
| 3.779335962268425 | -0.922 | 22.59 | -25.063 |
| 3.782477554922014 | -0.931 | 23.598 | -23.71 |
| 3.785619147575604 | -0.939 | 24.675 | -22.461 |
| 3.788760740229193 | -0.947 | 25.825 | -21.306 |
| 3.791902332882783 | -0.956 | 27.057 | -20.235 |
| 3.795043925536373 | -0.964 | 28.378 | -19.241 |
| 3.798185518189962 | -0.973 | 29.796 | -18.317 |
| 3.801327110843552 | -0.982 | 31.322 | -17.456 |
| 3.804468703497142 | -0.99 | 32.967 | -16.652 |
| 3.807610296150731 | -0.999 | 34.743 | -15.901 |
| 3.810751888804321 | -1.008 | 36.666 | -15.198 |
| 3.813893481457911 | -1.017 | 38.751 | -14.538 |
| 3.8170350741115 | -1.027 | 41.017 | -13.92 |
| 3.82017666676509 | -1.036 | 43.485 | -13.338 |
| 3.823318259418679 | -1.045 | 46.182 | -12.79 |
| 3.826459852072269 | -1.055 | 49.135 | -12.274 |
| 3.829601444725859 | -1.064 | 52.379 | -11.787 |
| 3.832743037379448 | -1.074 | 55.952 | -11.327 |
| 3.835884630033038 | -1.083 | 59.901 | -10.892 |
| 3.839026222686627 | -1.093 | 64.281 | -10.481 |
| 3.842167815340217 | -1.103 | 69.157 | -10.091 |
| 3.845309407993807 | -1.113 | 74.605 | -9.721 |
| 3.848451000647396 | -1.123 | 80.721 | -9.37 |
| 3.851592593300986 | -1.133 | 87.616 | -9.036 |
| 3.854734185954575 | -1.144 | 95.431 | -8.718 |
| 3.857875778608165 | -1.154 | 104.335 | -8.416 |
| 3.861017371261755 | -1.165 | 114.541 | -8.128 |
| 3.864158963915344 | -1.175 | 126.316 | -7.854 |
| 3.867300556568933 | -1.186 | 139.999 | -7.592 |
| 3.870442149222523 | -1.197 | 156.025 | -7.341 |
| 3.873583741876112 | -1.208 | 174.961 | -7.102 |
| 3.876725334529703 | -1.219 | 197.558 | -6.874 |
| 3.879866927183292 | -1.23 | 224.824 | -6.655 |
| 3.883008519836882 | -1.242 | 258.138 | -6.445 |
| 3.886150112490471 | -1.253 | 299.433 | -6.244 |
| 3.889291705144061 | -1.265 | 351.476 | -6.052 |
| 3.892433297797651 | -1.276 | 418.349 | -5.867 |
| 3.89557489045124 | -1.288 | 506.272 | -5.689 |
| 3.89871648310483 | -1.3 | 625.106 | -5.519 |
| 3.901858075758419 | -1.312 | 791.238 | -5.355 |
| 3.904999668412009 | -1.325 | 1033.556 | -5.197 |
| 3.908141261065598 | -1.337 | 1406.905 | -5.045 |
| 3.911282853719188 | -1.349 | 2026.09 | -4.899 |
| 3.914424446372778 | -1.362 | 3165.954 | -4.758 |
| 3.917566039026367 | -1.375 | 5628.621 | -4.622 |
| 3.920707631679957 | -1.388 | 12664.815 | -4.491 |
| 3.923849224333547 | -1.401 | 50660.258 | -4.365 |
| 3.926990816987136 | -1.414 | 45005950867318996356562944 | -4.243 |
| 3.930132409640726 | -1.428 | 50660.258 | -4.125 |
| 3.933274002294315 | -1.441 | 12664.815 | -4.011 |
| 3.936415594947905 | -1.455 | 5628.621 | -3.901 |
| 3.939557187601495 | -1.469 | 3165.954 | -3.794 |
| 3.942698780255084 | -1.483 | 2026.09 | -3.691 |
| 3.945840372908674 | -1.497 | 1406.905 | -3.591 |
| 3.948981965562263 | -1.511 | 1033.556 | -3.494 |
| 3.952123558215853 | -1.526 | 791.238 | -3.4 |
| 3.955265150869442 | -1.541 | 625.106 | -3.309 |
| 3.958406743523032 | -1.556 | 506.272 | -3.221 |
| 3.961548336176622 | -1.571 | 418.349 | -3.135 |
| 3.964689928830211 | -1.586 | 351.476 | -3.052 |
| 3.967831521483801 | -1.601 | 299.433 | -2.971 |
| 3.97097311413739 | -1.617 | 258.138 | -2.893 |
| 3.97411470679098 | -1.633 | 224.824 | -2.817 |
| 3.97725629944457 | -1.649 | 197.558 | -2.743 |
| 3.98039789209816 | -1.665 | 174.961 | -2.67 |
| 3.983539484751749 | -1.682 | 156.025 | -2.6 |
| 3.986681077405338 | -1.698 | 139.999 | -2.532 |
| 3.989822670058928 | -1.715 | 126.316 | -2.465 |
| 3.992964262712517 | -1.732 | 114.541 | -2.4 |
| 3.996105855366107 | -1.75 | 104.335 | -2.337 |
| 3.999247448019697 | -1.767 | 95.431 | -2.275 |
| 4.002389040673287 | -1.785 | 87.616 | -2.215 |
| 4.005530633326877 | -1.803 | 80.721 | -2.156 |
| 4.008672225980466 | -1.821 | 74.605 | -2.099 |
| 4.011813818634056 | -1.84 | 69.157 | -2.043 |
| 4.014955411287645 | -1.858 | 64.281 | -1.988 |
| 4.018097003941234 | -1.877 | 59.901 | -1.934 |
| 4.021238596594824 | -1.896 | 55.952 | -1.882 |
| 4.024380189248414 | -1.916 | 52.379 | -1.831 |
| 4.027521781902004 | -1.936 | 49.135 | -1.781 |
| 4.030663374555593 | -1.956 | 46.182 | -1.732 |
| 4.033804967209183 | -1.976 | 43.485 | -1.684 |
| 4.036946559862773 | -1.996 | 41.017 | -1.637 |
| 4.040088152516362 | -2.017 | 38.751 | -1.59 |
| 4.043229745169951 | -2.038 | 36.666 | -1.545 |
| 4.046371337823541 | -2.06 | 34.743 | -1.501 |
| 4.049512930477131 | -2.081 | 32.967 | -1.457 |
| 4.05265452313072 | -2.103 | 31.322 | -1.415 |
| 4.05579611578431 | -2.126 | 29.796 | -1.373 |
| 4.0589377084379 | -2.148 | 28.378 | -1.331 |
| 4.062079301091489 | -2.171 | 27.057 | -1.291 |
| 4.065220893745079 | -2.195 | 25.825 | -1.251 |
| 4.068362486398668 | -2.218 | 24.675 | -1.212 |
| 4.071504079052258 | -2.242 | 23.598 | -1.173 |
| 4.074645671705848 | -2.267 | 22.59 | -1.135 |
| 4.077787264359437 | -2.291 | 21.644 | -1.098 |
| 4.080928857013027 | -2.316 | 20.755 | -1.061 |
| 4.084070449666616 | -2.342 | 19.919 | -1.025 |
| 4.087212042320206 | -2.367 | 19.132 | -0.989 |
| 4.090353634973795 | -2.394 | 18.389 | -0.954 |
| 4.093495227627385 | -2.42 | 17.689 | -0.919 |
| 4.096636820280975 | -2.447 | 17.026 | -0.885 |
| 4.099778412934564 | -2.475 | 16.4 | -0.851 |
| 4.102920005588154 | -2.502 | 15.806 | -0.817 |
| 4.106061598241744 | -2.531 | 15.244 | -0.784 |
| 4.109203190895333 | -2.559 | 14.71 | -0.752 |
| 4.112344783548923 | -2.588 | 14.204 | -0.719 |
| 4.115486376202512 | -2.618 | 13.722 | -0.687 |
| 4.118627968856102 | -2.648 | 13.264 | -0.655 |
| 4.121769561509692 | -2.678 | 12.828 | -0.624 |
| 4.124911154163281 | -2.709 | 12.412 | -0.593 |
| 4.128052746816871 | -2.741 | 12.016 | -0.562 |
| 4.13119433947046 | -2.773 | 11.637 | -0.531 |
| 4.13433593212405 | -2.805 | 11.276 | -0.501 |
| 4.13747752477764 | -2.838 | 10.931 | -0.471 |
| 4.14061911743123 | -2.872 | 10.601 | -0.441 |
| 4.143760710084818 | -2.906 | 10.285 | -0.411 |
| 4.146902302738408 | -2.941 | 9.982 | -0.382 |
| 4.150043895391998 | -2.976 | 9.692 | -0.353 |
| 4.153185488045588 | -3.012 | 9.414 | -0.324 |
| 4.156327080699177 | -3.048 | 9.148 | -0.294 |
| 4.159468673352766 | -3.085 | 8.892 | -0.266 |
| 4.162610266006356 | -3.123 | 8.646 | -0.237 |
| 4.165751858659946 | -3.162 | 8.41 | -0.208 |
| 4.168893451313535 | -3.201 | 8.183 | -0.18 |
| 4.172035043967125 | -3.24 | 7.964 | -0.151 |
| 4.175176636620715 | -3.281 | 7.754 | -0.123 |
| 4.178318229274304 | -3.322 | 7.552 | -0.094 |
| 4.181459821927894 | -3.364 | 7.356 | -0.066 |
| 4.184601414581484 | -3.406 | 7.168 | -0.038 |
| 4.187743007235073 | -3.449 | 6.987 | -0.009 |
| 4.190884599888663 | -3.494 | 6.812 | 0.019 |
| 4.194026192542252 | -3.539 | 6.643 | 0.047 |
| 4.197167785195842 | -3.584 | 6.481 | 0.075 |
| 4.200309377849432 | -3.631 | 6.323 | 0.104 |
| 4.203450970503021 | -3.678 | 6.171 | 0.132 |
| 4.206592563156611 | -3.727 | 6.024 | 0.161 |
| 4.2097341558102 | -3.776 | 5.882 | 0.189 |
| 4.21287574846379 | -3.826 | 5.744 | 0.218 |
| 4.21601734111738 | -3.877 | 5.611 | 0.246 |
| 4.21915893377097 | -3.929 | 5.482 | 0.275 |
| 4.222300526424559 | -3.982 | 5.357 | 0.304 |
| 4.225442119078148 | -4.036 | 5.236 | 0.333 |
| 4.228583711731738 | -4.091 | 5.118 | 0.362 |
| 4.231725304385327 | -4.148 | 5.005 | 0.392 |
| 4.234866897038917 | -4.205 | 4.894 | 0.421 |
| 4.238008489692506 | -4.263 | 4.787 | 0.451 |
| 4.241150082346096 | -4.323 | 4.683 | 0.481 |
| 4.244291674999685 | -4.384 | 4.582 | 0.511 |
| 4.247433267653276 | -4.446 | 4.484 | 0.542 |
| 4.250574860306865 | -4.509 | 4.389 | 0.572 |
| 4.253716452960455 | -4.574 | 4.297 | 0.603 |
| 4.256858045614044 | -4.64 | 4.207 | 0.634 |
| 4.259999638267634 | -4.707 | 4.119 | 0.666 |
| 4.263141230921224 | -4.776 | 4.034 | 0.698 |
| 4.266282823574813 | -4.846 | 3.952 | 0.73 |
| 4.269424416228403 | -4.918 | 3.871 | 0.762 |
| 4.272566008881992 | -4.991 | 3.793 | 0.795 |
| 4.275707601535582 | -5.066 | 3.716 | 0.828 |
| 4.27884919418917 | -5.142 | 3.642 | 0.862 |
| 4.28199078684276 | -5.22 | 3.57 | 0.896 |
| 4.285132379496351 | -5.3 | 3.499 | 0.931 |
| 4.28827397214994 | -5.382 | 3.43 | 0.966 |
| 4.29141556480353 | -5.465 | 3.363 | 1.001 |
| 4.294557157457119 | -5.551 | 3.298 | 1.037 |
| 4.29769875011071 | -5.638 | 3.234 | 1.073 |
| 4.300840342764299 | -5.727 | 3.172 | 1.11 |
| 4.303981935417888 | -5.819 | 3.111 | 1.148 |
| 4.307123528071478 | -5.912 | 3.052 | 1.186 |
| 4.310265120725067 | -6.008 | 2.994 | 1.225 |
| 4.313406713378657 | -6.106 | 2.938 | 1.264 |
| 4.316548306032247 | -6.206 | 2.882 | 1.304 |
| 4.319689898685836 | -6.309 | 2.828 | 1.345 |
| 4.322831491339426 | -6.414 | 2.776 | 1.386 |
| 4.325973083993015 | -6.522 | 2.724 | 1.429 |
| 4.329114676646605 | -6.632 | 2.674 | 1.472 |
| 4.332256269300195 | -6.745 | 2.625 | 1.516 |
| 4.335397861953784 | -6.861 | 2.576 | 1.56 |
| 4.338539454607374 | -6.98 | 2.529 | 1.606 |
| 4.341681047260963 | -7.102 | 2.483 | 1.652 |
| 4.344822639914553 | -7.227 | 2.438 | 1.7 |
| 4.347964232568143 | -7.355 | 2.394 | 1.748 |
| 4.351105825221732 | -7.487 | 2.351 | 1.797 |
| 4.354247417875322 | -7.622 | 2.308 | 1.848 |
| 4.357389010528911 | -7.761 | 2.267 | 1.899 |
| 4.360530603182501 | -7.903 | 2.226 | 1.952 |
| 4.36367219583609 | -8.05 | 2.186 | 2.006 |
| 4.36681378848968 | -8.2 | 2.147 | 2.061 |
| 4.36995538114327 | -8.354 | 2.109 | 2.118 |
| 4.373096973796859 | -8.513 | 2.072 | 2.176 |
| 4.376238566450449 | -8.676 | 2.035 | 2.235 |
| 4.379380159104038 | -8.844 | 1.999 | 2.296 |
| 4.382521751757628 | -9.017 | 1.963 | 2.358 |
| 4.385663344411217 | -9.195 | 1.929 | 2.422 |
| 4.388804937064807 | -9.378 | 1.895 | 2.487 |
| 4.391946529718397 | -9.566 | 1.861 | 2.554 |
| 4.395088122371987 | -9.76 | 1.828 | 2.623 |
| 4.398229715025576 | -9.96 | 1.796 | 2.694 |
| 4.401371307679165 | -10.165 | 1.764 | 2.767 |
| 4.404512900332755 | -10.378 | 1.733 | 2.842 |
| 4.407654492986345 | -10.596 | 1.703 | 2.919 |
| 4.410796085639934 | -10.822 | 1.673 | 2.998 |
| 4.413937678293524 | -11.055 | 1.643 | 3.08 |
| 4.417079270947114 | -11.295 | 1.614 | 3.164 |
| 4.420220863600703 | -11.543 | 1.586 | 3.25 |
| 4.423362456254293 | -11.799 | 1.558 | 3.339 |
| 4.426504048907883 | -12.064 | 1.53 | 3.431 |
| 4.429645641561472 | -12.337 | 1.503 | 3.526 |
| 4.432787234215062 | -12.62 | 1.477 | 3.624 |
| 4.435928826868651 | -12.913 | 1.45 | 3.725 |
| 4.43907041952224 | -13.215 | 1.425 | 3.829 |
| 4.44221201217583 | -13.528 | 1.399 | 3.937 |
| 4.44535360482942 | -13.853 | 1.374 | 4.048 |
| 4.44849519748301 | -14.189 | 1.35 | 4.164 |
| 4.4516367901366 | -14.537 | 1.325 | 4.283 |
| 4.454778382790188 | -14.898 | 1.301 | 4.406 |
| 4.457919975443779 | -15.272 | 1.278 | 4.534 |
| 4.461061568097368 | -15.661 | 1.255 | 4.667 |
| 4.464203160750958 | -16.064 | 1.232 | 4.804 |
| 4.467344753404547 | -16.484 | 1.209 | 4.947 |
| 4.470486346058137 | -16.919 | 1.187 | 5.095 |
| 4.473627938711726 | -17.372 | 1.165 | 5.249 |
| 4.476769531365316 | -17.843 | 1.144 | 5.409 |
| 4.479911124018905 | -18.333 | 1.122 | 5.575 |
| 4.483052716672495 | -18.843 | 1.101 | 5.747 |
| 4.486194309326085 | -19.375 | 1.081 | 5.927 |
| 4.489335901979674 | -19.93 | 1.06 | 6.115 |
| 4.492477494633264 | -20.508 | 1.04 | 6.31 |
| 4.495619087286854 | -21.112 | 1.02 | 6.514 |
| 4.498760679940443 | -21.743 | 1.001 | 6.727 |
| 4.501902272594033 | -22.402 | 0.981 | 6.949 |
| 4.505043865247622 | -23.091 | 0.962 | 7.181 |
| 4.508185457901212 | -23.812 | 0.943 | 7.424 |
| 4.511327050554801 | -24.568 | 0.924 | 7.678 |
| 4.514468643208391 | -25.359 | 0.906 | 7.944 |
| 4.517610235861981 | -26.189 | 0.888 | 8.223 |
| 4.520751828515571 | -27.061 | 0.87 | 8.515 |
| 4.52389342116916 | -27.976 | 0.852 | 8.822 |
| 4.52703501382275 | -28.938 | 0.834 | 9.145 |
| 4.530176606476339 | -29.951 | 0.817 | 9.485 |
| 4.533318199129928 | -31.017 | 0.799 | 9.842 |
| 4.536459791783518 | -32.141 | 0.782 | 10.218 |
| 4.539601384437108 | -33.326 | 0.765 | 10.616 |
| 4.542742977090698 | -34.578 | 0.749 | 11.035 |
| 4.545884569744287 | -35.902 | 0.732 | 11.478 |
| 4.549026162397876 | -37.303 | 0.716 | 11.946 |
| 4.552167755051466 | -38.787 | 0.699 | 12.443 |
| 4.555309347705056 | -40.36 | 0.683 | 12.969 |
| 4.558450940358646 | -42.032 | 0.667 | 13.528 |
| 4.561592533012235 | -43.808 | 0.652 | 14.122 |
| 4.564734125665825 | -45.7 | 0.636 | 14.754 |
| 4.567875718319415 | -47.715 | 0.62 | 15.427 |
| 4.571017310973004 | -49.867 | 0.605 | 16.146 |
| 4.574158903626594 | -52.168 | 0.59 | 16.914 |
| 4.577300496280183 | -54.63 | 0.575 | 17.736 |
| 4.580442088933772 | -57.271 | 0.56 | 18.618 |
| 4.583583681587362 | -60.107 | 0.545 | 19.565 |
| 4.586725274240952 | -63.158 | 0.53 | 20.583 |
| 4.589866866894542 | -66.447 | 0.516 | 21.681 |
| 4.593008459548131 | -70 | 0.501 | 22.866 |
| 4.596150052201721 | -73.844 | 0.487 | 24.149 |
| 4.59929164485531 | -78.013 | 0.472 | 25.539 |
| 4.6024332375089 | -82.544 | 0.458 | 27.051 |
| 4.60557483016249 | -87.481 | 0.444 | 28.698 |
| 4.608716422816079 | -92.873 | 0.43 | 30.496 |
| 4.611858015469668 | -98.779 | 0.416 | 32.466 |
| 4.614999608123258 | -105.266 | 0.402 | 34.629 |
| 4.618141200776848 | -112.412 | 0.388 | 37.012 |
| 4.621282793430437 | -120.31 | 0.375 | 39.646 |
| 4.624424386084027 | -129.069 | 0.361 | 42.566 |
| 4.627565978737617 | -138.819 | 0.348 | 45.817 |
| 4.630707571391206 | -149.716 | 0.334 | 49.451 |
| 4.633849164044795 | -161.947 | 0.321 | 53.528 |
| 4.636990756698386 | -175.738 | 0.307 | 58.126 |
| 4.640132349351975 | -191.366 | 0.294 | 63.336 |
| 4.643273942005564 | -209.174 | 0.281 | 69.273 |
| 4.646415534659154 | -229.586 | 0.268 | 76.078 |
| 4.649557127312744 | -253.136 | 0.255 | 83.928 |
| 4.652698719966334 | -280.501 | 0.242 | 93.05 |
| 4.655840312619923 | -312.553 | 0.229 | 103.735 |
| 4.658981905273513 | -350.425 | 0.216 | 116.36 |
| 4.662123497927102 | -395.619 | 0.203 | 131.425 |
| 4.665265090580692 | -450.15 | 0.19 | 149.602 |
| 4.668406683234282 | -516.778 | 0.177 | 171.812 |
| 4.671548275887871 | -599.367 | 0.164 | 199.342 |
| 4.674689868541461 | -703.453 | 0.152 | 234.038 |
| 4.67783146119505 | -837.198 | 0.139 | 278.62 |
| 4.68097305384864 | -1013.045 | 0.126 | 337.236 |
| 4.68411464650223 | -1250.712 | 0.113 | 416.458 |
| 4.687256239155819 | -1582.977 | 0.101 | 527.214 |
| 4.690397831809409 | -2067.613 | 0.088 | 688.759 |
| 4.693539424462998 | -2814.311 | 0.075 | 937.659 |
| 4.696681017116588 | -4052.681 | 0.063 | 1350.449 |
| 4.699822609770177 | -6332.407 | 0.05 | 2110.358 |
| 4.702964202423767 | -11257.743 | 0.038 | 3752.136 |
| 4.706105795077356 | -25330.129 | 0.025 | 8442.932 |
| 4.709247387730946 | -101321.017 | 0.013 | 33773.228 |
| 4.712388980384535 | -42254127899613098051371008 | 0 | 14139077694956498979913728 |
| 4.715530573038126 | -101321.017 | -0.013 | 33773.228 |
| 4.718672165691715 | -25330.129 | -0.025 | 8442.932 |
| 4.721813758345305 | -11257.743 | -0.038 | 3752.136 |
| 4.724955350998894 | -6332.407 | -0.05 | 2110.358 |
| 4.728096943652484 | -4052.681 | -0.063 | 1350.449 |
| 4.731238536306074 | -2814.311 | -0.075 | 937.659 |
| 4.734380128959663 | -2067.613 | -0.088 | 688.759 |
| 4.737521721613253 | -1582.977 | -0.101 | 527.214 |
| 4.740663314266842 | -1250.712 | -0.113 | 416.458 |
| 4.743804906920432 | -1013.045 | -0.126 | 337.236 |
| 4.74694649957402 | -837.198 | -0.139 | 278.62 |
| 4.750088092227611 | -703.453 | -0.152 | 234.038 |
| 4.7532296848812 | -599.367 | -0.164 | 199.342 |
| 4.75637127753479 | -516.778 | -0.177 | 171.812 |
| 4.75951287018838 | -450.15 | -0.19 | 149.602 |
| 4.76265446284197 | -395.619 | -0.203 | 131.425 |
| 4.765796055495559 | -350.425 | -0.216 | 116.36 |
| 4.768937648149149 | -312.553 | -0.229 | 103.735 |
| 4.772079240802738 | -280.501 | -0.242 | 93.05 |
| 4.775220833456327 | -253.136 | -0.255 | 83.928 |
| 4.778362426109917 | -229.586 | -0.268 | 76.078 |
| 4.781504018763507 | -209.174 | -0.281 | 69.273 |
| 4.784645611417097 | -191.366 | -0.294 | 63.336 |
| 4.787787204070686 | -175.738 | -0.307 | 58.126 |
| 4.790928796724275 | -161.947 | -0.321 | 53.528 |
| 4.794070389377865 | -149.716 | -0.334 | 49.451 |
| 4.797211982031455 | -138.819 | -0.348 | 45.817 |
| 4.800353574685045 | -129.069 | -0.361 | 42.566 |
| 4.803495167338634 | -120.31 | -0.375 | 39.646 |
| 4.806636759992224 | -112.412 | -0.388 | 37.012 |
| 4.809778352645814 | -105.266 | -0.402 | 34.629 |
| 4.812919945299403 | -98.779 | -0.416 | 32.466 |
| 4.816061537952993 | -92.873 | -0.43 | 30.496 |
| 4.819203130606582 | -87.481 | -0.444 | 28.698 |
| 4.822344723260172 | -82.544 | -0.458 | 27.051 |
| 4.825486315913761 | -78.013 | -0.472 | 25.539 |
| 4.828627908567351 | -73.844 | -0.487 | 24.149 |
| 4.83176950122094 | -70 | -0.501 | 22.866 |
| 4.83491109387453 | -66.447 | -0.516 | 21.681 |
| 4.83805268652812 | -63.158 | -0.53 | 20.583 |
| 4.841194279181709 | -60.107 | -0.545 | 19.565 |
| 4.844335871835299 | -57.271 | -0.56 | 18.618 |
| 4.847477464488889 | -54.63 | -0.575 | 17.736 |
| 4.850619057142478 | -52.168 | -0.59 | 16.914 |
| 4.853760649796068 | -49.867 | -0.605 | 16.146 |
| 4.856902242449657 | -47.715 | -0.62 | 15.427 |
| 4.860043835103247 | -45.7 | -0.636 | 14.754 |
| 4.863185427756837 | -43.808 | -0.652 | 14.122 |
| 4.866327020410426 | -42.032 | -0.667 | 13.528 |
| 4.869468613064015 | -40.36 | -0.683 | 12.969 |
| 4.872610205717605 | -38.787 | -0.699 | 12.443 |
| 4.875751798371195 | -37.303 | -0.716 | 11.946 |
| 4.878893391024784 | -35.902 | -0.732 | 11.478 |
| 4.882034983678374 | -34.578 | -0.749 | 11.035 |
| 4.885176576331964 | -33.326 | -0.765 | 10.616 |
| 4.888318168985553 | -32.141 | -0.782 | 10.218 |
| 4.891459761639143 | -31.017 | -0.799 | 9.842 |
| 4.894601354292733 | -29.951 | -0.817 | 9.485 |
| 4.897742946946322 | -28.938 | -0.834 | 9.145 |
| 4.900884539599912 | -27.976 | -0.852 | 8.822 |
| 4.904026132253501 | -27.061 | -0.87 | 8.515 |
| 4.907167724907091 | -26.189 | -0.888 | 8.223 |
| 4.91030931756068 | -25.359 | -0.906 | 7.944 |
| 4.91345091021427 | -24.568 | -0.924 | 7.678 |
| 4.91659250286786 | -23.812 | -0.943 | 7.424 |
| 4.91973409552145 | -23.091 | -0.962 | 7.181 |
| 4.922875688175039 | -22.402 | -0.981 | 6.949 |
| 4.926017280828628 | -21.743 | -1.001 | 6.727 |
| 4.929158873482218 | -21.112 | -1.02 | 6.514 |
| 4.932300466135808 | -20.508 | -1.04 | 6.31 |
| 4.935442058789397 | -19.93 | -1.06 | 6.115 |
| 4.938583651442987 | -19.375 | -1.081 | 5.927 |
| 4.941725244096576 | -18.843 | -1.101 | 5.747 |
| 4.944866836750166 | -18.333 | -1.122 | 5.575 |
| 4.948008429403755 | -17.843 | -1.144 | 5.409 |
| 4.951150022057345 | -17.372 | -1.165 | 5.249 |
| 4.954291614710935 | -16.919 | -1.187 | 5.095 |
| 4.957433207364524 | -16.484 | -1.209 | 4.947 |
| 4.960574800018114 | -16.064 | -1.232 | 4.804 |
| 4.963716392671704 | -15.661 | -1.255 | 4.667 |
| 4.966857985325293 | -15.272 | -1.278 | 4.534 |
| 4.969999577978883 | -14.898 | -1.301 | 4.406 |
| 4.973141170632472 | -14.537 | -1.325 | 4.283 |
| 4.976282763286062 | -14.189 | -1.35 | 4.164 |
| 4.979424355939651 | -13.853 | -1.374 | 4.048 |
| 4.982565948593241 | -13.528 | -1.399 | 3.937 |
| 4.985707541246831 | -13.215 | -1.425 | 3.829 |
| 4.98884913390042 | -12.913 | -1.45 | 3.725 |
| 4.99199072655401 | -12.62 | -1.477 | 3.624 |
| 4.9951323192076 | -12.337 | -1.503 | 3.526 |
| 4.99827391186119 | -12.064 | -1.53 | 3.431 |
| 5.00141550451478 | -11.799 | -1.558 | 3.339 |
| 5.004557097168369 | -11.543 | -1.586 | 3.25 |
| 5.007698689821958 | -11.295 | -1.614 | 3.164 |
| 5.010840282475548 | -11.055 | -1.643 | 3.08 |
| 5.013981875129137 | -10.822 | -1.673 | 2.998 |
| 5.017123467782727 | -10.596 | -1.703 | 2.919 |
| 5.020265060436317 | -10.378 | -1.733 | 2.842 |
| 5.023406653089906 | -10.165 | -1.764 | 2.767 |
| 5.026548245743496 | -9.96 | -1.796 | 2.694 |
| 5.029689838397085 | -9.76 | -1.828 | 2.623 |
| 5.032831431050674 | -9.566 | -1.861 | 2.554 |
| 5.035973023704264 | -9.378 | -1.895 | 2.487 |
| 5.039114616357854 | -9.195 | -1.929 | 2.422 |
| 5.042256209011444 | -9.017 | -1.963 | 2.358 |
| 5.045397801665033 | -8.844 | -1.999 | 2.296 |
| 5.048539394318622 | -8.676 | -2.035 | 2.235 |
| 5.051680986972213 | -8.513 | -2.072 | 2.176 |
| 5.054822579625802 | -8.354 | -2.109 | 2.118 |
| 5.057964172279392 | -8.2 | -2.147 | 2.061 |
| 5.061105764932981 | -8.05 | -2.186 | 2.006 |
| 5.064247357586571 | -7.903 | -2.226 | 1.952 |
| 5.067388950240161 | -7.761 | -2.267 | 1.899 |
| 5.07053054289375 | -7.622 | -2.308 | 1.848 |
| 5.07367213554734 | -7.487 | -2.351 | 1.797 |
| 5.07681372820093 | -7.355 | -2.394 | 1.748 |
| 5.079955320854519 | -7.227 | -2.438 | 1.7 |
| 5.083096913508108 | -7.102 | -2.483 | 1.652 |
| 5.086238506161698 | -6.98 | -2.529 | 1.606 |
| 5.089380098815288 | -6.861 | -2.576 | 1.56 |
| 5.092521691468877 | -6.745 | -2.625 | 1.516 |
| 5.095663284122466 | -6.632 | -2.674 | 1.472 |
| 5.098804876776057 | -6.522 | -2.724 | 1.429 |
| 5.101946469429646 | -6.414 | -2.776 | 1.386 |
| 5.105088062083236 | -6.309 | -2.828 | 1.345 |
| 5.108229654736825 | -6.206 | -2.882 | 1.304 |
| 5.111371247390415 | -6.106 | -2.938 | 1.264 |
| 5.114512840044005 | -6.008 | -2.994 | 1.225 |
| 5.117654432697594 | -5.912 | -3.052 | 1.186 |
| 5.120796025351184 | -5.819 | -3.111 | 1.148 |
| 5.123937618004773 | -5.727 | -3.172 | 1.11 |
| 5.127079210658363 | -5.638 | -3.234 | 1.073 |
| 5.130220803311953 | -5.551 | -3.298 | 1.037 |
| 5.133362395965542 | -5.465 | -3.363 | 1.001 |
| 5.136503988619131 | -5.382 | -3.43 | 0.966 |
| 5.13964558127272 | -5.3 | -3.499 | 0.931 |
| 5.142787173926311 | -5.22 | -3.57 | 0.896 |
| 5.1459287665799 | -5.142 | -3.642 | 0.862 |
| 5.14907035923349 | -5.066 | -3.716 | 0.828 |
| 5.15221195188708 | -4.991 | -3.793 | 0.795 |
| 5.15535354454067 | -4.918 | -3.871 | 0.762 |
| 5.158495137194259 | -4.846 | -3.952 | 0.73 |
| 5.161636729847848 | -4.776 | -4.034 | 0.698 |
| 5.164778322501438 | -4.707 | -4.119 | 0.666 |
| 5.167919915155028 | -4.64 | -4.207 | 0.634 |
| 5.171061507808617 | -4.574 | -4.297 | 0.603 |
| 5.174203100462206 | -4.509 | -4.389 | 0.572 |
| 5.177344693115796 | -4.446 | -4.484 | 0.542 |
| 5.180486285769386 | -4.384 | -4.582 | 0.511 |
| 5.183627878422976 | -4.323 | -4.683 | 0.481 |
| 5.186769471076565 | -4.263 | -4.787 | 0.451 |
| 5.189911063730155 | -4.205 | -4.894 | 0.421 |
| 5.193052656383744 | -4.148 | -5.005 | 0.392 |
| 5.196194249037334 | -4.091 | -5.118 | 0.362 |
| 5.199335841690924 | -4.036 | -5.236 | 0.333 |
| 5.202477434344513 | -3.982 | -5.357 | 0.304 |
| 5.205619026998103 | -3.929 | -5.482 | 0.275 |
| 5.208760619651692 | -3.877 | -5.611 | 0.246 |
| 5.211902212305282 | -3.826 | -5.744 | 0.218 |
| 5.215043804958871 | -3.776 | -5.882 | 0.189 |
| 5.218185397612461 | -3.727 | -6.024 | 0.161 |
| 5.221326990266051 | -3.678 | -6.171 | 0.132 |
| 5.22446858291964 | -3.631 | -6.323 | 0.104 |
| 5.22761017557323 | -3.584 | -6.481 | 0.075 |
| 5.23075176822682 | -3.539 | -6.643 | 0.047 |
| 5.23389336088041 | -3.494 | -6.812 | 0.019 |
| 5.237034953533999 | -3.449 | -6.987 | -0.009 |
| 5.240176546187588 | -3.406 | -7.168 | -0.038 |
| 5.243318138841178 | -3.364 | -7.356 | -0.066 |
| 5.246459731494767 | -3.322 | -7.552 | -0.094 |
| 5.249601324148357 | -3.281 | -7.754 | -0.123 |
| 5.252742916801947 | -3.24 | -7.964 | -0.151 |
| 5.255884509455536 | -3.201 | -8.183 | -0.18 |
| 5.259026102109125 | -3.162 | -8.41 | -0.208 |
| 5.262167694762715 | -3.123 | -8.646 | -0.237 |
| 5.265309287416305 | -3.085 | -8.892 | -0.266 |
| 5.268450880069895 | -3.048 | -9.148 | -0.294 |
| 5.271592472723484 | -3.012 | -9.414 | -0.324 |
| 5.274734065377074 | -2.976 | -9.692 | -0.353 |
| 5.277875658030664 | -2.941 | -9.982 | -0.382 |
| 5.281017250684253 | -2.906 | -10.285 | -0.411 |
| 5.284158843337843 | -2.872 | -10.601 | -0.441 |
| 5.287300435991432 | -2.838 | -10.931 | -0.471 |
| 5.290442028645022 | -2.805 | -11.276 | -0.501 |
| 5.293583621298612 | -2.773 | -11.637 | -0.531 |
| 5.296725213952201 | -2.741 | -12.016 | -0.562 |
| 5.299866806605791 | -2.709 | -12.412 | -0.593 |
| 5.30300839925938 | -2.678 | -12.828 | -0.624 |
| 5.30614999191297 | -2.648 | -13.264 | -0.655 |
| 5.30929158456656 | -2.618 | -13.722 | -0.687 |
| 5.312433177220149 | -2.588 | -14.204 | -0.719 |
| 5.315574769873739 | -2.559 | -14.71 | -0.752 |
| 5.318716362527328 | -2.531 | -15.244 | -0.784 |
| 5.321857955180918 | -2.502 | -15.806 | -0.817 |
| 5.324999547834508 | -2.475 | -16.4 | -0.851 |
| 5.328141140488097 | -2.447 | -17.026 | -0.885 |
| 5.331282733141686 | -2.42 | -17.689 | -0.919 |
| 5.334424325795276 | -2.394 | -18.389 | -0.954 |
| 5.337565918448866 | -2.367 | -19.132 | -0.989 |
| 5.340707511102456 | -2.342 | -19.919 | -1.025 |
| 5.343849103756045 | -2.316 | -20.755 | -1.061 |
| 5.346990696409634 | -2.291 | -21.644 | -1.098 |
| 5.350132289063224 | -2.267 | -22.59 | -1.135 |
| 5.353273881716814 | -2.242 | -23.598 | -1.173 |
| 5.356415474370403 | -2.218 | -24.675 | -1.212 |
| 5.359557067023993 | -2.195 | -25.825 | -1.251 |
| 5.362698659677583 | -2.171 | -27.057 | -1.291 |
| 5.365840252331172 | -2.148 | -28.378 | -1.331 |
| 5.368981844984762 | -2.126 | -29.796 | -1.373 |
| 5.372123437638351 | -2.103 | -31.322 | -1.415 |
| 5.375265030291941 | -2.081 | -32.967 | -1.457 |
| 5.378406622945531 | -2.06 | -34.743 | -1.501 |
| 5.38154821559912 | -2.038 | -36.666 | -1.545 |
| 5.38468980825271 | -2.017 | -38.751 | -1.59 |
| 5.387831400906299 | -1.996 | -41.017 | -1.637 |
| 5.39097299355989 | -1.976 | -43.485 | -1.684 |
| 5.394114586213479 | -1.956 | -46.182 | -1.732 |
| 5.397256178867068 | -1.936 | -49.135 | -1.781 |
| 5.400397771520657 | -1.916 | -52.379 | -1.831 |
| 5.403539364174247 | -1.896 | -55.952 | -1.882 |
| 5.406680956827837 | -1.877 | -59.901 | -1.934 |
| 5.409822549481426 | -1.858 | -64.281 | -1.988 |
| 5.412964142135016 | -1.84 | -69.157 | -2.043 |
| 5.416105734788605 | -1.821 | -74.605 | -2.099 |
| 5.419247327442195 | -1.803 | -80.721 | -2.156 |
| 5.422388920095785 | -1.785 | -87.616 | -2.215 |
| 5.425530512749375 | -1.767 | -95.431 | -2.275 |
| 5.428672105402964 | -1.75 | -104.335 | -2.337 |
| 5.431813698056554 | -1.732 | -114.541 | -2.4 |
| 5.434955290710143 | -1.715 | -126.316 | -2.465 |
| 5.438096883363733 | -1.698 | -139.999 | -2.532 |
| 5.441238476017322 | -1.682 | -156.025 | -2.6 |
| 5.444380068670912 | -1.665 | -174.961 | -2.67 |
| 5.447521661324502 | -1.649 | -197.558 | -2.743 |
| 5.450663253978091 | -1.633 | -224.824 | -2.817 |
| 5.453804846631681 | -1.617 | -258.138 | -2.893 |
| 5.456946439285271 | -1.601 | -299.433 | -2.971 |
| 5.46008803193886 | -1.586 | -351.476 | -3.052 |
| 5.46322962459245 | -1.571 | -418.349 | -3.135 |
| 5.466371217246039 | -1.556 | -506.272 | -3.221 |
| 5.46951280989963 | -1.541 | -625.106 | -3.309 |
| 5.472654402553218 | -1.526 | -791.238 | -3.4 |
| 5.475795995206808 | -1.511 | -1033.556 | -3.494 |
| 5.478937587860398 | -1.497 | -1406.905 | -3.591 |
| 5.482079180513987 | -1.483 | -2026.09 | -3.691 |
| 5.485220773167577 | -1.469 | -3165.954 | -3.794 |
| 5.488362365821166 | -1.455 | -5628.621 | -3.901 |
| 5.491503958474756 | -1.441 | -12664.815 | -4.011 |
| 5.494645551128346 | -1.428 | -50660.258 | -4.125 |
| 5.497787143781935 | -1.414 | -12166922683954200477433856 | -4.243 |
| 5.500928736435525 | -1.401 | -50660.258 | -4.365 |
| 5.504070329089115 | -1.388 | -12664.815 | -4.491 |
| 5.507211921742704 | -1.375 | -5628.621 | -4.622 |
| 5.510353514396294 | -1.362 | -3165.954 | -4.758 |
| 5.513495107049883 | -1.349 | -2026.09 | -4.899 |
| 5.516636699703473 | -1.337 | -1406.905 | -5.045 |
| 5.519778292357062 | -1.325 | -1033.556 | -5.197 |
| 5.522919885010652 | -1.312 | -791.238 | -5.355 |
| 5.526061477664242 | -1.3 | -625.106 | -5.519 |
| 5.529203070317831 | -1.288 | -506.272 | -5.689 |
| 5.532344662971421 | -1.276 | -418.349 | -5.867 |
| 5.535486255625011 | -1.265 | -351.476 | -6.052 |
| 5.5386278482786 | -1.253 | -299.433 | -6.244 |
| 5.54176944093219 | -1.242 | -258.138 | -6.445 |
| 5.544911033585779 | -1.23 | -224.824 | -6.655 |
| 5.54805262623937 | -1.219 | -197.558 | -6.874 |
| 5.551194218892959 | -1.208 | -174.961 | -7.102 |
| 5.554335811546548 | -1.197 | -156.025 | -7.341 |
| 5.557477404200137 | -1.186 | -139.999 | -7.592 |
| 5.560618996853727 | -1.175 | -126.316 | -7.854 |
| 5.563760589507317 | -1.165 | -114.541 | -8.128 |
| 5.566902182160906 | -1.154 | -104.335 | -8.416 |
| 5.570043774814496 | -1.144 | -95.431 | -8.718 |
| 5.573185367468086 | -1.133 | -87.616 | -9.036 |
| 5.576326960121675 | -1.123 | -80.721 | -9.37 |
| 5.579468552775264 | -1.113 | -74.605 | -9.721 |
| 5.582610145428854 | -1.103 | -69.157 | -10.091 |
| 5.585751738082444 | -1.093 | -64.281 | -10.481 |
| 5.588893330736034 | -1.083 | -59.901 | -10.892 |
| 5.592034923389623 | -1.074 | -55.952 | -11.327 |
| 5.595176516043213 | -1.064 | -52.379 | -11.787 |
| 5.598318108696803 | -1.055 | -49.135 | -12.274 |
| 5.601459701350392 | -1.045 | -46.182 | -12.79 |
| 5.604601294003982 | -1.036 | -43.485 | -13.338 |
| 5.607742886657571 | -1.027 | -41.017 | -13.92 |
| 5.610884479311161 | -1.017 | -38.751 | -14.538 |
| 5.61402607196475 | -1.008 | -36.666 | -15.198 |
| 5.61716766461834 | -0.999 | -34.743 | -15.901 |
| 5.62030925727193 | -0.99 | -32.967 | -16.652 |
| 5.623450849925519 | -0.982 | -31.322 | -17.456 |
| 5.626592442579109 | -0.973 | -29.796 | -18.317 |
| 5.629734035232698 | -0.964 | -28.378 | -19.241 |
| 5.632875627886288 | -0.956 | -27.057 | -20.235 |
| 5.636017220539878 | -0.947 | -25.825 | -21.306 |
| 5.639158813193467 | -0.939 | -24.675 | -22.461 |
| 5.642300405847057 | -0.931 | -23.598 | -23.71 |
| 5.645441998500646 | -0.922 | -22.59 | -25.063 |
| 5.648583591154236 | -0.914 | -21.644 | -26.533 |
| 5.651725183807825 | -0.906 | -20.755 | -28.133 |
| 5.654866776461415 | -0.898 | -19.919 | -29.879 |
| 5.658008369115005 | -0.89 | -19.132 | -31.789 |
| 5.661149961768594 | -0.882 | -18.389 | -33.885 |
| 5.664291554422184 | -0.874 | -17.689 | -36.192 |
| 5.667433147075774 | -0.867 | -17.026 | -38.738 |
| 5.670574739729363 | -0.859 | -16.4 | -41.558 |
| 5.673716332382953 | -0.851 | -15.806 | -44.694 |
| 5.676857925036542 | -0.844 | -15.244 | -48.193 |
| 5.679999517690132 | -0.836 | -14.71 | -52.115 |
| 5.683141110343721 | -0.829 | -14.204 | -56.53 |
| 5.686282702997311 | -0.822 | -13.722 | -61.525 |
| 5.689424295650901 | -0.814 | -13.264 | -67.205 |
| 5.69256588830449 | -0.807 | -12.828 | -73.703 |
| 5.69570748095808 | -0.8 | -12.412 | -81.182 |
| 5.69884907361167 | -0.793 | -12.016 | -89.852 |
| 5.701990666265259 | -0.786 | -11.637 | -99.979 |
| 5.705132258918849 | -0.779 | -11.276 | -111.908 |
| 5.708273851572438 | -0.772 | -10.931 | -126.095 |
| 5.711415444226028 | -0.765 | -10.601 | -143.146 |
| 5.714557036879618 | -0.758 | -10.285 | -163.89 |
| 5.717698629533207 | -0.752 | -9.982 | -189.474 |
| 5.720840222186797 | -0.745 | -9.692 | -221.531 |
| 5.723981814840386 | -0.738 | -9.414 | -262.442 |
| 5.727123407493976 | -0.732 | -9.148 | -315.798 |
| 5.730265000147565 | -0.725 | -8.892 | -387.207 |
| 5.733406592801155 | -0.719 | -8.646 | -485.841 |
| 5.736548185454744 | -0.712 | -8.41 | -627.523 |
| 5.739689778108334 | -0.706 | -8.183 | -841.504 |
| 5.742831370761924 | -0.7 | -7.964 | -1186.857 |
| 5.745972963415514 | -0.693 | -7.754 | -1798.101 |
| 5.749114556069103 | -0.687 | -7.552 | -3039.135 |
| 5.752256148722693 | -0.681 | -7.356 | -6202.838 |
| 5.755397741376282 | -0.675 | -7.168 | -18997.222 |
| 5.758539334029872 | -0.669 | -6.987 | -303963.051 |
| 5.761680926683462 | -0.663 | -6.812 | -75990.388 |
| 5.764822519337051 | -0.657 | -6.643 | -12158.042 |
| 5.767964111990641 | -0.651 | -6.481 | -4748.93 |
| 5.77110570464423 | -0.645 | -6.323 | -2511.595 |
| 5.77424729729782 | -0.639 | -6.171 | -1550.334 |
| 5.77738888995141 | -0.633 | -6.024 | -1051.276 |
| 5.780530482605 | -0.627 | -5.882 | -759.408 |
| 5.783672075258588 | -0.622 | -5.744 | -574.099 |
| 5.786813667912178 | -0.616 | -5.611 | -449.149 |
| 5.789955260565768 | -0.61 | -5.482 | -360.93 |
| 5.793096853219358 | -0.605 | -5.357 | -296.338 |
| 5.796238445872947 | -0.599 | -5.236 | -247.631 |
| 5.799380038526537 | -0.594 | -5.118 | -209.999 |
| 5.802521631180126 | -0.588 | -5.005 | -180.32 |
| 5.805663223833715 | -0.583 | -4.894 | -156.503 |
| 5.808804816487306 | -0.577 | -4.787 | -137.099 |
| 5.811946409140895 | -0.572 | -4.683 | -121.081 |
| 5.815088001794485 | -0.567 | -4.582 | -107.706 |
| 5.818229594448074 | -0.561 | -4.484 | -96.422 |
| 5.821371187101663 | -0.556 | -4.389 | -86.815 |
| 5.824512779755254 | -0.551 | -4.297 | -78.568 |
| 5.827654372408843 | -0.546 | -4.207 | -71.437 |
| 5.830795965062433 | -0.54 | -4.119 | -65.228 |
| 5.833937557716022 | -0.535 | -4.034 | -59.789 |
| 5.837079150369612 | -0.53 | -3.952 | -54.999 |
| 5.840220743023201 | -0.525 | -3.871 | -50.757 |
| 5.843362335676791 | -0.52 | -3.793 | -46.983 |
| 5.846503928330381 | -0.515 | -3.716 | -43.611 |
| 5.84964552098397 | -0.51 | -3.642 | -40.585 |
| 5.85278711363756 | -0.505 | -3.57 | -37.861 |
| 5.85592870629115 | -0.5 | -3.499 | -35.398 |
| 5.85907029894474 | -0.495 | -3.43 | -33.164 |
| 5.862211891598329 | -0.491 | -3.363 | -31.133 |
| 5.865353484251918 | -0.486 | -3.298 | -29.279 |
| 5.868495076905508 | -0.481 | -3.234 | -27.584 |
| 5.871636669559098 | -0.476 | -3.172 | -26.029 |
| 5.874778262212687 | -0.472 | -3.111 | -24.6 |
| 5.877919854866277 | -0.467 | -3.052 | -23.282 |
| 5.881061447519866 | -0.462 | -2.994 | -22.066 |
| 5.884203040173456 | -0.458 | -2.938 | -20.94 |
| 5.887344632827046 | -0.453 | -2.882 | -19.896 |
| 5.890486225480635 | -0.448 | -2.828 | -18.926 |
| 5.893627818134224 | -0.444 | -2.776 | -18.023 |
| 5.896769410787814 | -0.439 | -2.724 | -17.182 |
| 5.899911003441404 | -0.435 | -2.674 | -16.396 |
| 5.903052596094994 | -0.43 | -2.625 | -15.661 |
| 5.906194188748583 | -0.426 | -2.576 | -14.973 |
| 5.909335781402172 | -0.421 | -2.529 | -14.328 |
| 5.912477374055762 | -0.417 | -2.483 | -13.722 |
| 5.915618966709352 | -0.413 | -2.438 | -13.152 |
| 5.918760559362942 | -0.408 | -2.394 | -12.615 |
| 5.921902152016531 | -0.404 | -2.351 | -12.109 |
| 5.92504374467012 | -0.4 | -2.308 | -11.631 |
| 5.92818533732371 | -0.395 | -2.267 | -11.18 |
| 5.9313269299773 | -0.391 | -2.226 | -10.753 |
| 5.93446852263089 | -0.387 | -2.186 | -10.348 |
| 5.93761011528448 | -0.383 | -2.147 | -9.965 |
| 5.940751707938068 | -0.378 | -2.109 | -9.602 |
| 5.943893300591658 | -0.374 | -2.072 | -9.256 |
| 5.947034893245248 | -0.37 | -2.035 | -8.928 |
| 5.950176485898837 | -0.366 | -1.999 | -8.616 |
| 5.953318078552427 | -0.362 | -1.963 | -8.319 |
| 5.956459671206017 | -0.358 | -1.929 | -8.035 |
| 5.959601263859606 | -0.354 | -1.895 | -7.765 |
| 5.962742856513196 | -0.35 | -1.861 | -7.507 |
| 5.965884449166785 | -0.346 | -1.828 | -7.26 |
| 5.969026041820375 | -0.342 | -1.796 | -7.025 |
| 5.972167634473964 | -0.338 | -1.764 | -6.8 |
| 5.975309227127554 | -0.334 | -1.733 | -6.584 |
| 5.978450819781144 | -0.33 | -1.703 | -6.377 |
| 5.981592412434733 | -0.326 | -1.673 | -6.179 |
| 5.984734005088323 | -0.322 | -1.643 | -5.989 |
| 5.987875597741913 | -0.318 | -1.614 | -5.807 |
| 5.991017190395502 | -0.314 | -1.586 | -5.632 |
| 5.994158783049092 | -0.31 | -1.558 | -5.463 |
| 5.997300375702681 | -0.306 | -1.53 | -5.301 |
| 6.000441968356271 | -0.303 | -1.503 | -5.146 |
| 6.003583561009861 | -0.299 | -1.477 | -4.996 |
| 6.00672515366345 | -0.295 | -1.45 | -4.851 |
| 6.00986674631704 | -0.291 | -1.425 | -4.712 |
| 6.01300833897063 | -0.287 | -1.399 | -4.578 |
| 6.01614993162422 | -0.284 | -1.374 | -4.448 |
| 6.019291524277808 | -0.28 | -1.35 | -4.324 |
| 6.022433116931398 | -0.276 | -1.325 | -4.203 |
| 6.025574709584988 | -0.272 | -1.301 | -4.086 |
| 6.028716302238577 | -0.269 | -1.278 | -3.974 |
| 6.031857894892167 | -0.265 | -1.255 | -3.865 |
| 6.034999487545757 | -0.261 | -1.232 | -3.759 |
| 6.038141080199346 | -0.258 | -1.209 | -3.657 |
| 6.041282672852935 | -0.254 | -1.187 | -3.558 |
| 6.044424265506525 | -0.251 | -1.165 | -3.462 |
| 6.047565858160115 | -0.247 | -1.144 | -3.37 |
| 6.050707450813704 | -0.243 | -1.122 | -3.28 |
| 6.053849043467294 | -0.24 | -1.101 | -3.192 |
| 6.056990636120884 | -0.236 | -1.081 | -3.107 |
| 6.060132228774473 | -0.233 | -1.06 | -3.025 |
| 6.063273821428063 | -0.229 | -1.04 | -2.945 |
| 6.066415414081653 | -0.226 | -1.02 | -2.867 |
| 6.069557006735242 | -0.222 | -1.001 | -2.792 |
| 6.072698599388831 | -0.218 | -0.981 | -2.718 |
| 6.07584019204242 | -0.215 | -0.962 | -2.647 |
| 6.078981784696011 | -0.211 | -0.943 | -2.577 |
| 6.082123377349601 | -0.208 | -0.924 | -2.509 |
| 6.08526497000319 | -0.205 | -0.906 | -2.443 |
| 6.08840656265678 | -0.201 | -0.888 | -2.379 |
| 6.09154815531037 | -0.198 | -0.87 | -2.316 |
| 6.094689747963959 | -0.194 | -0.852 | -2.255 |
| 6.097831340617549 | -0.191 | -0.834 | -2.195 |
| 6.100972933271138 | -0.187 | -0.817 | -2.137 |
| 6.104114525924728 | -0.184 | -0.799 | -2.08 |
| 6.107256118578317 | -0.181 | -0.782 | -2.024 |
| 6.110397711231907 | -0.177 | -0.765 | -1.97 |
| 6.113539303885497 | -0.174 | -0.749 | -1.917 |
| 6.116680896539086 | -0.17 | -0.732 | -1.865 |
| 6.119822489192675 | -0.167 | -0.716 | -1.814 |
| 6.122964081846265 | -0.164 | -0.699 | -1.764 |
| 6.126105674499855 | -0.16 | -0.683 | -1.716 |
| 6.129247267153445 | -0.157 | -0.667 | -1.668 |
| 6.132388859807034 | -0.154 | -0.652 | -1.621 |
| 6.135530452460624 | -0.15 | -0.636 | -1.575 |
| 6.138672045114213 | -0.147 | -0.62 | -1.53 |
| 6.141813637767803 | -0.144 | -0.605 | -1.486 |
| 6.144955230421393 | -0.14 | -0.59 | -1.443 |
| 6.148096823074982 | -0.137 | -0.575 | -1.4 |
| 6.151238415728571 | -0.134 | -0.56 | -1.359 |
| 6.154380008382161 | -0.131 | -0.545 | -1.318 |
| 6.157521601035751 | -0.127 | -0.53 | -1.277 |
| 6.16066319368934 | -0.124 | -0.516 | -1.238 |
| 6.16380478634293 | -0.121 | -0.501 | -1.199 |
| 6.16694637899652 | -0.118 | -0.487 | -1.161 |
| 6.170087971650109 | -0.114 | -0.472 | -1.123 |
| 6.173229564303698 | -0.111 | -0.458 | -1.086 |
| 6.176371156957289 | -0.108 | -0.444 | -1.049 |
| 6.179512749610878 | -0.105 | -0.43 | -1.013 |
| 6.182654342264468 | -0.101 | -0.416 | -0.977 |
| 6.185795934918057 | -0.098 | -0.402 | -0.942 |
| 6.188937527571647 | -0.095 | -0.388 | -0.908 |
| 6.192079120225237 | -0.092 | -0.375 | -0.873 |
| 6.195220712878826 | -0.089 | -0.361 | -0.84 |
| 6.198362305532415 | -0.085 | -0.348 | -0.806 |
| 6.201503898186005 | -0.082 | -0.334 | -0.773 |
| 6.204645490839594 | -0.079 | -0.321 | -0.741 |
| 6.207787083493184 | -0.076 | -0.307 | -0.708 |
| 6.210928676146774 | -0.073 | -0.294 | -0.677 |
| 6.214070268800364 | -0.069 | -0.281 | -0.645 |
| 6.217211861453953 | -0.066 | -0.268 | -0.614 |
| 6.220353454107543 | -0.063 | -0.255 | -0.583 |
| 6.223495046761133 | -0.06 | -0.242 | -0.552 |
| 6.226636639414722 | -0.057 | -0.229 | -0.521 |
| 6.229778232068312 | -0.054 | -0.216 | -0.491 |
| 6.232919824721901 | -0.05 | -0.203 | -0.461 |
| 6.236061417375491 | -0.047 | -0.19 | -0.431 |
| 6.23920301002908 | -0.044 | -0.177 | -0.402 |
| 6.24234460268267 | -0.041 | -0.164 | -0.372 |
| 6.24548619533626 | -0.038 | -0.152 | -0.343 |
| 6.24862778798985 | -0.035 | -0.139 | -0.314 |
| 6.251769380643438 | -0.031 | -0.126 | -0.285 |
| 6.254910973297028 | -0.028 | -0.113 | -0.256 |
| 6.258052565950618 | -0.025 | -0.101 | -0.227 |
| 6.261194158604208 | -0.022 | -0.088 | -0.199 |
| 6.264335751257797 | -0.019 | -0.075 | -0.17 |
| 6.267477343911387 | -0.016 | -0.063 | -0.142 |
| 6.270618936564976 | -0.013 | -0.05 | -0.113 |
| 6.273760529218566 | -0.009 | -0.038 | -0.085 |
| 6.276902121872155 | -0.006 | -0.025 | -0.057 |
| 6.280043714525745 | -0.003 | -0.013 | -0.028 |
| 6.283185307179335 | 0 | 0 | 0 |